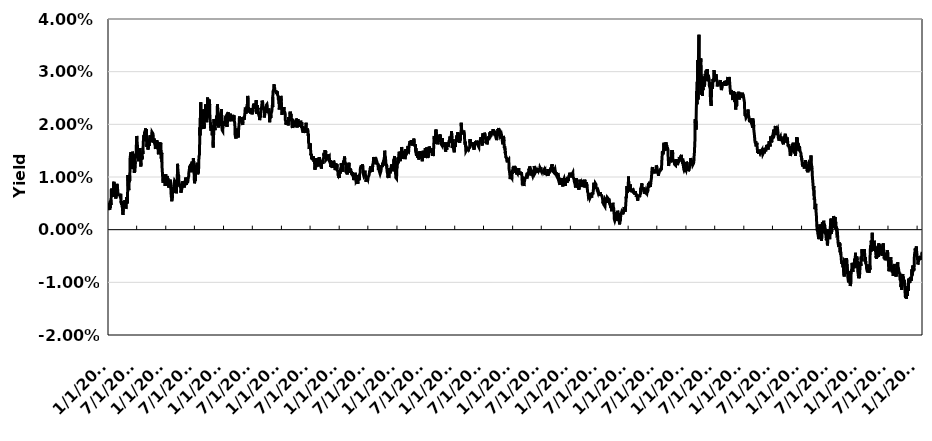
| Category | Spread |
|---|---|
| 1/4/10 | 0.004 |
| 1/5/10 | 0.005 |
| 1/6/10 | 0.004 |
| 1/7/10 | 0.004 |
| 1/8/10 | 0.005 |
| 1/11/10 | 0.004 |
| 1/12/10 | 0.005 |
| 1/13/10 | 0.004 |
| 1/14/10 | 0.005 |
| 1/15/10 | 0.005 |
| 1/19/10 | 0.005 |
| 1/20/10 | 0.006 |
| 1/21/10 | 0.007 |
| 1/22/10 | 0.008 |
| 1/25/10 | 0.007 |
| 1/26/10 | 0.007 |
| 1/27/10 | 0.007 |
| 1/28/10 | 0.008 |
| 1/29/10 | 0.008 |
| 2/1/10 | 0.007 |
| 2/2/10 | 0.006 |
| 2/3/10 | 0.006 |
| 2/4/10 | 0.008 |
| 2/5/10 | 0.009 |
| 2/8/10 | 0.009 |
| 2/9/10 | 0.008 |
| 2/10/10 | 0.008 |
| 2/11/10 | 0.008 |
| 2/12/10 | 0.008 |
| 2/16/10 | 0.008 |
| 2/17/10 | 0.007 |
| 2/18/10 | 0.006 |
| 2/19/10 | 0.006 |
| 2/22/10 | 0.006 |
| 2/23/10 | 0.007 |
| 2/24/10 | 0.007 |
| 2/25/10 | 0.008 |
| 2/26/10 | 0.009 |
| 3/1/10 | 0.008 |
| 3/2/10 | 0.008 |
| 3/3/10 | 0.008 |
| 3/4/10 | 0.008 |
| 3/5/10 | 0.007 |
| 3/8/10 | 0.006 |
| 3/9/10 | 0.007 |
| 3/10/10 | 0.006 |
| 3/11/10 | 0.006 |
| 3/12/10 | 0.007 |
| 3/15/10 | 0.006 |
| 3/16/10 | 0.006 |
| 3/17/10 | 0.006 |
| 3/18/10 | 0.006 |
| 3/19/10 | 0.006 |
| 3/22/10 | 0.007 |
| 3/23/10 | 0.006 |
| 3/24/10 | 0.005 |
| 3/25/10 | 0.005 |
| 3/26/10 | 0.005 |
| 3/29/10 | 0.005 |
| 3/30/10 | 0.005 |
| 3/31/10 | 0.005 |
| 4/1/10 | 0.004 |
| 4/5/10 | 0.003 |
| 4/6/10 | 0.003 |
| 4/7/10 | 0.004 |
| 4/8/10 | 0.004 |
| 4/9/10 | 0.004 |
| 4/12/10 | 0.004 |
| 4/13/10 | 0.005 |
| 4/14/10 | 0.004 |
| 4/15/10 | 0.004 |
| 4/16/10 | 0.006 |
| 4/19/10 | 0.005 |
| 4/20/10 | 0.005 |
| 4/21/10 | 0.005 |
| 4/22/10 | 0.005 |
| 4/23/10 | 0.004 |
| 4/26/10 | 0.004 |
| 4/27/10 | 0.006 |
| 4/28/10 | 0.005 |
| 4/29/10 | 0.005 |
| 4/30/10 | 0.006 |
| 5/3/10 | 0.005 |
| 5/4/10 | 0.007 |
| 5/5/10 | 0.008 |
| 5/6/10 | 0.01 |
| 5/7/10 | 0.01 |
| 5/10/10 | 0.008 |
| 5/11/10 | 0.008 |
| 5/12/10 | 0.008 |
| 5/13/10 | 0.008 |
| 5/14/10 | 0.009 |
| 5/17/10 | 0.009 |
| 5/18/10 | 0.01 |
| 5/19/10 | 0.011 |
| 5/20/10 | 0.013 |
| 5/21/10 | 0.014 |
| 5/24/10 | 0.014 |
| 5/25/10 | 0.015 |
| 5/26/10 | 0.015 |
| 5/27/10 | 0.012 |
| 5/28/10 | 0.013 |
| 6/1/10 | 0.014 |
| 6/2/10 | 0.012 |
| 6/3/10 | 0.012 |
| 6/4/10 | 0.015 |
| 6/7/10 | 0.015 |
| 6/8/10 | 0.014 |
| 6/9/10 | 0.014 |
| 6/10/10 | 0.012 |
| 6/11/10 | 0.013 |
| 6/14/10 | 0.012 |
| 6/15/10 | 0.011 |
| 6/16/10 | 0.011 |
| 6/17/10 | 0.011 |
| 6/18/10 | 0.011 |
| 6/21/10 | 0.011 |
| 6/22/10 | 0.013 |
| 6/23/10 | 0.014 |
| 6/24/10 | 0.014 |
| 6/25/10 | 0.014 |
| 6/28/10 | 0.015 |
| 6/29/10 | 0.016 |
| 6/30/10 | 0.017 |
| 7/1/10 | 0.018 |
| 7/2/10 | 0.017 |
| 7/6/10 | 0.017 |
| 7/7/10 | 0.015 |
| 7/8/10 | 0.015 |
| 7/9/10 | 0.014 |
| 7/12/10 | 0.014 |
| 7/13/10 | 0.013 |
| 7/14/10 | 0.014 |
| 7/15/10 | 0.014 |
| 7/16/10 | 0.015 |
| 7/19/10 | 0.014 |
| 7/20/10 | 0.014 |
| 7/21/10 | 0.016 |
| 7/22/10 | 0.014 |
| 7/23/10 | 0.014 |
| 7/26/10 | 0.013 |
| 7/27/10 | 0.012 |
| 7/28/10 | 0.013 |
| 7/29/10 | 0.014 |
| 7/30/10 | 0.015 |
| 8/2/10 | 0.013 |
| 8/3/10 | 0.014 |
| 8/4/10 | 0.013 |
| 8/5/10 | 0.014 |
| 8/6/10 | 0.015 |
| 8/9/10 | 0.014 |
| 8/10/10 | 0.015 |
| 8/11/10 | 0.017 |
| 8/12/10 | 0.017 |
| 8/13/10 | 0.017 |
| 8/16/10 | 0.018 |
| 8/17/10 | 0.017 |
| 8/18/10 | 0.017 |
| 8/19/10 | 0.018 |
| 8/20/10 | 0.018 |
| 8/23/10 | 0.018 |
| 8/24/10 | 0.019 |
| 8/25/10 | 0.019 |
| 8/26/10 | 0.019 |
| 8/27/10 | 0.017 |
| 8/30/10 | 0.019 |
| 8/31/10 | 0.019 |
| 9/1/10 | 0.017 |
| 9/2/10 | 0.017 |
| 9/3/10 | 0.016 |
| 9/7/10 | 0.017 |
| 9/8/10 | 0.017 |
| 9/9/10 | 0.015 |
| 9/10/10 | 0.015 |
| 9/13/10 | 0.016 |
| 9/14/10 | 0.016 |
| 9/15/10 | 0.016 |
| 9/16/10 | 0.016 |
| 9/17/10 | 0.016 |
| 9/20/10 | 0.016 |
| 9/21/10 | 0.017 |
| 9/22/10 | 0.017 |
| 9/23/10 | 0.018 |
| 9/24/10 | 0.017 |
| 9/27/10 | 0.017 |
| 9/28/10 | 0.018 |
| 9/29/10 | 0.018 |
| 9/30/10 | 0.018 |
| 10/1/10 | 0.017 |
| 10/4/10 | 0.018 |
| 10/5/10 | 0.017 |
| 10/6/10 | 0.018 |
| 10/7/10 | 0.018 |
| 10/8/10 | 0.018 |
| 10/12/10 | 0.018 |
| 10/13/10 | 0.018 |
| 10/14/10 | 0.017 |
| 10/15/10 | 0.016 |
| 10/18/10 | 0.017 |
| 10/19/10 | 0.017 |
| 10/20/10 | 0.017 |
| 10/21/10 | 0.016 |
| 10/22/10 | 0.016 |
| 10/25/10 | 0.017 |
| 10/26/10 | 0.016 |
| 10/27/10 | 0.015 |
| 10/28/10 | 0.016 |
| 10/29/10 | 0.016 |
| 11/1/10 | 0.016 |
| 11/2/10 | 0.016 |
| 11/3/10 | 0.016 |
| 11/4/10 | 0.017 |
| 11/5/10 | 0.017 |
| 11/8/10 | 0.017 |
| 11/9/10 | 0.016 |
| 11/10/10 | 0.017 |
| 11/11/10 | 0.017 |
| 11/12/10 | 0.016 |
| 11/15/10 | 0.014 |
| 11/16/10 | 0.016 |
| 11/17/10 | 0.015 |
| 11/18/10 | 0.015 |
| 11/19/10 | 0.015 |
| 11/22/10 | 0.016 |
| 11/23/10 | 0.017 |
| 11/24/10 | 0.015 |
| 11/26/10 | 0.016 |
| 11/29/10 | 0.016 |
| 11/30/10 | 0.016 |
| 12/1/10 | 0.014 |
| 12/2/10 | 0.014 |
| 12/3/10 | 0.014 |
| 12/6/10 | 0.015 |
| 12/7/10 | 0.013 |
| 12/8/10 | 0.012 |
| 12/9/10 | 0.012 |
| 12/10/10 | 0.011 |
| 12/13/10 | 0.011 |
| 12/14/10 | 0.009 |
| 12/15/10 | 0.009 |
| 12/16/10 | 0.009 |
| 12/17/10 | 0.01 |
| 12/20/10 | 0.01 |
| 12/21/10 | 0.01 |
| 12/22/10 | 0.01 |
| 12/23/10 | 0.009 |
| 12/27/10 | 0.01 |
| 12/28/10 | 0.008 |
| 12/29/10 | 0.01 |
| 12/30/10 | 0.01 |
| 12/31/10 | 0.01 |
| 1/3/11 | 0.01 |
| 1/4/11 | 0.01 |
| 1/5/11 | 0.008 |
| 1/6/11 | 0.009 |
| 1/7/11 | 0.01 |
| 1/10/11 | 0.01 |
| 1/11/11 | 0.01 |
| 1/12/11 | 0.009 |
| 1/13/11 | 0.01 |
| 1/14/11 | 0.009 |
| 1/18/11 | 0.009 |
| 1/19/11 | 0.009 |
| 1/20/11 | 0.008 |
| 1/21/11 | 0.008 |
| 1/24/11 | 0.008 |
| 1/25/11 | 0.009 |
| 1/26/11 | 0.008 |
| 1/27/11 | 0.008 |
| 1/28/11 | 0.01 |
| 1/31/11 | 0.009 |
| 2/1/11 | 0.008 |
| 2/2/11 | 0.008 |
| 2/3/11 | 0.007 |
| 2/4/11 | 0.006 |
| 2/7/11 | 0.006 |
| 2/8/11 | 0.005 |
| 2/9/11 | 0.006 |
| 2/10/11 | 0.006 |
| 2/11/11 | 0.007 |
| 2/14/11 | 0.007 |
| 2/15/11 | 0.007 |
| 2/16/11 | 0.007 |
| 2/17/11 | 0.008 |
| 2/18/11 | 0.007 |
| 2/22/11 | 0.009 |
| 2/23/11 | 0.009 |
| 2/24/11 | 0.009 |
| 2/25/11 | 0.009 |
| 2/28/11 | 0.009 |
| 3/1/11 | 0.009 |
| 3/2/11 | 0.009 |
| 3/3/11 | 0.007 |
| 3/4/11 | 0.008 |
| 3/7/11 | 0.008 |
| 3/8/11 | 0.007 |
| 3/9/11 | 0.007 |
| 3/10/11 | 0.009 |
| 3/11/11 | 0.008 |
| 3/14/11 | 0.009 |
| 3/15/11 | 0.011 |
| 3/16/11 | 0.012 |
| 3/17/11 | 0.012 |
| 3/18/11 | 0.012 |
| 3/21/11 | 0.01 |
| 3/22/11 | 0.01 |
| 3/23/11 | 0.01 |
| 3/24/11 | 0.01 |
| 3/25/11 | 0.009 |
| 3/28/11 | 0.009 |
| 3/29/11 | 0.008 |
| 3/30/11 | 0.008 |
| 3/31/11 | 0.008 |
| 4/1/11 | 0.008 |
| 4/4/11 | 0.008 |
| 4/5/11 | 0.008 |
| 4/6/11 | 0.007 |
| 4/7/11 | 0.007 |
| 4/8/11 | 0.007 |
| 4/11/11 | 0.008 |
| 4/12/11 | 0.008 |
| 4/13/11 | 0.009 |
| 4/14/11 | 0.008 |
| 4/15/11 | 0.008 |
| 4/18/11 | 0.009 |
| 4/19/11 | 0.009 |
| 4/20/11 | 0.008 |
| 4/21/11 | 0.008 |
| 4/25/11 | 0.009 |
| 4/26/11 | 0.009 |
| 4/27/11 | 0.008 |
| 4/28/11 | 0.008 |
| 4/29/11 | 0.008 |
| 5/2/11 | 0.008 |
| 5/3/11 | 0.008 |
| 5/4/11 | 0.009 |
| 5/5/11 | 0.01 |
| 5/6/11 | 0.01 |
| 5/9/11 | 0.01 |
| 5/10/11 | 0.009 |
| 5/11/11 | 0.009 |
| 5/12/11 | 0.008 |
| 5/13/11 | 0.009 |
| 5/16/11 | 0.009 |
| 5/17/11 | 0.009 |
| 5/18/11 | 0.009 |
| 5/19/11 | 0.009 |
| 5/20/11 | 0.009 |
| 5/23/11 | 0.01 |
| 5/24/11 | 0.01 |
| 5/25/11 | 0.01 |
| 5/26/11 | 0.011 |
| 5/27/11 | 0.011 |
| 5/31/11 | 0.011 |
| 6/1/11 | 0.012 |
| 6/2/11 | 0.011 |
| 6/3/11 | 0.012 |
| 6/6/11 | 0.012 |
| 6/7/11 | 0.012 |
| 6/8/11 | 0.012 |
| 6/9/11 | 0.012 |
| 6/10/11 | 0.012 |
| 6/13/11 | 0.012 |
| 6/14/11 | 0.011 |
| 6/15/11 | 0.013 |
| 6/16/11 | 0.013 |
| 6/17/11 | 0.013 |
| 6/20/11 | 0.012 |
| 6/21/11 | 0.012 |
| 6/22/11 | 0.012 |
| 6/23/11 | 0.013 |
| 6/24/11 | 0.014 |
| 6/27/11 | 0.012 |
| 6/28/11 | 0.011 |
| 6/29/11 | 0.01 |
| 6/30/11 | 0.01 |
| 7/1/11 | 0.009 |
| 7/5/11 | 0.01 |
| 7/6/11 | 0.01 |
| 7/7/11 | 0.009 |
| 7/8/11 | 0.011 |
| 7/11/11 | 0.012 |
| 7/12/11 | 0.012 |
| 7/13/11 | 0.012 |
| 7/14/11 | 0.012 |
| 7/15/11 | 0.012 |
| 7/18/11 | 0.013 |
| 7/19/11 | 0.013 |
| 7/20/11 | 0.012 |
| 7/21/11 | 0.011 |
| 7/22/11 | 0.011 |
| 7/25/11 | 0.011 |
| 7/26/11 | 0.011 |
| 7/27/11 | 0.011 |
| 7/28/11 | 0.012 |
| 7/29/11 | 0.014 |
| 8/1/11 | 0.014 |
| 8/2/11 | 0.016 |
| 8/3/11 | 0.016 |
| 8/4/11 | 0.019 |
| 8/5/11 | 0.018 |
| 8/8/11 | 0.022 |
| 8/9/11 | 0.023 |
| 8/10/11 | 0.024 |
| 8/11/11 | 0.021 |
| 8/12/11 | 0.022 |
| 8/15/11 | 0.02 |
| 8/16/11 | 0.021 |
| 8/17/11 | 0.021 |
| 8/18/11 | 0.022 |
| 8/19/11 | 0.023 |
| 8/22/11 | 0.022 |
| 8/23/11 | 0.021 |
| 8/24/11 | 0.019 |
| 8/25/11 | 0.02 |
| 8/26/11 | 0.021 |
| 8/29/11 | 0.019 |
| 8/30/11 | 0.02 |
| 8/31/11 | 0.019 |
| 9/1/11 | 0.02 |
| 9/2/11 | 0.022 |
| 9/6/11 | 0.023 |
| 9/7/11 | 0.022 |
| 9/8/11 | 0.022 |
| 9/9/11 | 0.024 |
| 9/12/11 | 0.023 |
| 9/13/11 | 0.023 |
| 9/14/11 | 0.022 |
| 9/15/11 | 0.021 |
| 9/16/11 | 0.02 |
| 9/19/11 | 0.022 |
| 9/20/11 | 0.021 |
| 9/21/11 | 0.023 |
| 9/22/11 | 0.025 |
| 9/23/11 | 0.024 |
| 9/26/11 | 0.022 |
| 9/27/11 | 0.022 |
| 9/28/11 | 0.022 |
| 9/29/11 | 0.021 |
| 9/30/11 | 0.023 |
| 10/3/11 | 0.025 |
| 10/4/11 | 0.025 |
| 10/5/11 | 0.024 |
| 10/6/11 | 0.022 |
| 10/7/11 | 0.021 |
| 10/11/11 | 0.02 |
| 10/12/11 | 0.019 |
| 10/13/11 | 0.02 |
| 10/14/11 | 0.019 |
| 10/17/11 | 0.02 |
| 10/18/11 | 0.019 |
| 10/19/11 | 0.019 |
| 10/20/11 | 0.019 |
| 10/21/11 | 0.018 |
| 10/24/11 | 0.018 |
| 10/25/11 | 0.019 |
| 10/26/11 | 0.018 |
| 10/27/11 | 0.016 |
| 10/28/11 | 0.017 |
| 10/31/11 | 0.019 |
| 11/1/11 | 0.021 |
| 11/2/11 | 0.02 |
| 11/3/11 | 0.019 |
| 11/4/11 | 0.02 |
| 11/7/11 | 0.02 |
| 11/8/11 | 0.019 |
| 11/9/11 | 0.021 |
| 11/10/11 | 0.02 |
| 11/14/11 | 0.02 |
| 11/15/11 | 0.02 |
| 11/16/11 | 0.021 |
| 11/17/11 | 0.022 |
| 11/18/11 | 0.021 |
| 11/21/11 | 0.022 |
| 11/22/11 | 0.023 |
| 11/23/11 | 0.024 |
| 11/25/11 | 0.023 |
| 11/28/11 | 0.022 |
| 11/29/11 | 0.021 |
| 11/30/11 | 0.02 |
| 12/1/11 | 0.019 |
| 12/2/11 | 0.02 |
| 12/5/11 | 0.02 |
| 12/6/11 | 0.02 |
| 12/7/11 | 0.02 |
| 12/8/11 | 0.021 |
| 12/9/11 | 0.02 |
| 12/12/11 | 0.021 |
| 12/13/11 | 0.021 |
| 12/14/11 | 0.022 |
| 12/15/11 | 0.021 |
| 12/16/11 | 0.022 |
| 12/19/11 | 0.023 |
| 12/20/11 | 0.021 |
| 12/21/11 | 0.02 |
| 12/22/11 | 0.02 |
| 12/23/11 | 0.019 |
| 12/27/11 | 0.019 |
| 12/28/11 | 0.02 |
| 12/29/11 | 0.02 |
| 12/30/11 | 0.02 |
| 1/3/12 | 0.02 |
| 1/4/12 | 0.02 |
| 1/5/12 | 0.02 |
| 1/6/12 | 0.02 |
| 1/9/12 | 0.02 |
| 1/10/12 | 0.02 |
| 1/11/12 | 0.021 |
| 1/12/12 | 0.021 |
| 1/13/12 | 0.021 |
| 1/17/12 | 0.022 |
| 1/18/12 | 0.021 |
| 1/19/12 | 0.021 |
| 1/20/12 | 0.02 |
| 1/23/12 | 0.02 |
| 1/24/12 | 0.02 |
| 1/25/12 | 0.02 |
| 1/26/12 | 0.02 |
| 1/27/12 | 0.021 |
| 1/30/12 | 0.022 |
| 1/31/12 | 0.022 |
| 2/1/12 | 0.022 |
| 2/2/12 | 0.022 |
| 2/3/12 | 0.021 |
| 2/6/12 | 0.022 |
| 2/7/12 | 0.021 |
| 2/8/12 | 0.021 |
| 2/9/12 | 0.021 |
| 2/10/12 | 0.022 |
| 2/13/12 | 0.021 |
| 2/14/12 | 0.022 |
| 2/15/12 | 0.022 |
| 2/16/12 | 0.021 |
| 2/17/12 | 0.021 |
| 2/21/12 | 0.021 |
| 2/22/12 | 0.021 |
| 2/23/12 | 0.021 |
| 2/24/12 | 0.021 |
| 2/27/12 | 0.022 |
| 2/28/12 | 0.022 |
| 2/29/12 | 0.022 |
| 3/1/12 | 0.021 |
| 3/2/12 | 0.021 |
| 3/5/12 | 0.021 |
| 3/6/12 | 0.022 |
| 3/7/12 | 0.022 |
| 3/8/12 | 0.021 |
| 3/9/12 | 0.021 |
| 3/12/12 | 0.02 |
| 3/13/12 | 0.019 |
| 3/14/12 | 0.018 |
| 3/15/12 | 0.018 |
| 3/16/12 | 0.018 |
| 3/19/12 | 0.017 |
| 3/20/12 | 0.017 |
| 3/21/12 | 0.018 |
| 3/22/12 | 0.018 |
| 3/23/12 | 0.019 |
| 3/26/12 | 0.018 |
| 3/27/12 | 0.019 |
| 3/28/12 | 0.019 |
| 3/29/12 | 0.019 |
| 3/30/12 | 0.018 |
| 4/2/12 | 0.018 |
| 4/3/12 | 0.018 |
| 4/4/12 | 0.018 |
| 4/5/12 | 0.019 |
| 4/9/12 | 0.021 |
| 4/10/12 | 0.022 |
| 4/11/12 | 0.021 |
| 4/12/12 | 0.02 |
| 4/13/12 | 0.021 |
| 4/16/12 | 0.021 |
| 4/17/12 | 0.021 |
| 4/18/12 | 0.021 |
| 4/19/12 | 0.021 |
| 4/20/12 | 0.021 |
| 4/23/12 | 0.021 |
| 4/24/12 | 0.021 |
| 4/25/12 | 0.02 |
| 4/26/12 | 0.02 |
| 4/27/12 | 0.02 |
| 4/30/12 | 0.02 |
| 5/1/12 | 0.02 |
| 5/2/12 | 0.02 |
| 5/3/12 | 0.021 |
| 5/4/12 | 0.021 |
| 5/7/12 | 0.021 |
| 5/8/12 | 0.021 |
| 5/9/12 | 0.021 |
| 5/10/12 | 0.021 |
| 5/11/12 | 0.021 |
| 5/14/12 | 0.022 |
| 5/15/12 | 0.022 |
| 5/16/12 | 0.022 |
| 5/17/12 | 0.023 |
| 5/18/12 | 0.023 |
| 5/21/12 | 0.023 |
| 5/22/12 | 0.022 |
| 5/23/12 | 0.023 |
| 5/24/12 | 0.022 |
| 5/25/12 | 0.022 |
| 5/29/12 | 0.022 |
| 5/30/12 | 0.024 |
| 5/31/12 | 0.024 |
| 6/1/12 | 0.025 |
| 6/4/12 | 0.025 |
| 6/5/12 | 0.024 |
| 6/6/12 | 0.023 |
| 6/7/12 | 0.023 |
| 6/8/12 | 0.022 |
| 6/11/12 | 0.023 |
| 6/12/12 | 0.022 |
| 6/13/12 | 0.023 |
| 6/14/12 | 0.022 |
| 6/15/12 | 0.022 |
| 6/18/12 | 0.022 |
| 6/19/12 | 0.022 |
| 6/20/12 | 0.022 |
| 6/21/12 | 0.023 |
| 6/22/12 | 0.022 |
| 6/25/12 | 0.023 |
| 6/26/12 | 0.023 |
| 6/27/12 | 0.022 |
| 6/28/12 | 0.023 |
| 6/29/12 | 0.022 |
| 7/2/12 | 0.023 |
| 7/3/12 | 0.022 |
| 7/5/12 | 0.023 |
| 7/6/12 | 0.023 |
| 7/9/12 | 0.024 |
| 7/10/12 | 0.024 |
| 7/11/12 | 0.024 |
| 7/12/12 | 0.024 |
| 7/13/12 | 0.023 |
| 7/16/12 | 0.024 |
| 7/17/12 | 0.023 |
| 7/18/12 | 0.023 |
| 7/19/12 | 0.023 |
| 7/20/12 | 0.023 |
| 7/23/12 | 0.024 |
| 7/24/12 | 0.024 |
| 7/25/12 | 0.025 |
| 7/26/12 | 0.024 |
| 7/27/12 | 0.022 |
| 7/30/12 | 0.022 |
| 7/31/12 | 0.023 |
| 8/1/12 | 0.023 |
| 8/2/12 | 0.024 |
| 8/3/12 | 0.022 |
| 8/6/12 | 0.022 |
| 8/7/12 | 0.022 |
| 8/8/12 | 0.022 |
| 8/9/12 | 0.022 |
| 8/10/12 | 0.022 |
| 8/13/12 | 0.022 |
| 8/14/12 | 0.022 |
| 8/15/12 | 0.021 |
| 8/16/12 | 0.021 |
| 8/17/12 | 0.021 |
| 8/20/12 | 0.021 |
| 8/21/12 | 0.021 |
| 8/22/12 | 0.022 |
| 8/23/12 | 0.023 |
| 8/24/12 | 0.023 |
| 8/27/12 | 0.023 |
| 8/28/12 | 0.023 |
| 8/29/12 | 0.023 |
| 8/30/12 | 0.024 |
| 8/31/12 | 0.024 |
| 9/4/12 | 0.024 |
| 9/5/12 | 0.024 |
| 9/6/12 | 0.023 |
| 9/7/12 | 0.023 |
| 9/10/12 | 0.023 |
| 9/11/12 | 0.023 |
| 9/12/12 | 0.023 |
| 9/13/12 | 0.022 |
| 9/14/12 | 0.021 |
| 9/17/12 | 0.022 |
| 9/18/12 | 0.022 |
| 9/19/12 | 0.023 |
| 9/20/12 | 0.022 |
| 9/21/12 | 0.023 |
| 9/24/12 | 0.023 |
| 9/25/12 | 0.023 |
| 9/26/12 | 0.024 |
| 9/27/12 | 0.024 |
| 9/28/12 | 0.024 |
| 10/1/12 | 0.024 |
| 10/2/12 | 0.024 |
| 10/3/12 | 0.023 |
| 10/4/12 | 0.023 |
| 10/5/12 | 0.022 |
| 10/9/12 | 0.022 |
| 10/10/12 | 0.022 |
| 10/11/12 | 0.023 |
| 10/12/12 | 0.023 |
| 10/15/12 | 0.023 |
| 10/16/12 | 0.022 |
| 10/17/12 | 0.021 |
| 10/18/12 | 0.02 |
| 10/19/12 | 0.021 |
| 10/22/12 | 0.021 |
| 10/23/12 | 0.022 |
| 10/24/12 | 0.022 |
| 10/25/12 | 0.021 |
| 10/26/12 | 0.022 |
| 10/31/12 | 0.022 |
| 11/1/12 | 0.023 |
| 11/2/12 | 0.023 |
| 11/5/12 | 0.024 |
| 11/6/12 | 0.023 |
| 11/7/12 | 0.025 |
| 11/8/12 | 0.026 |
| 11/9/12 | 0.026 |
| 11/13/12 | 0.027 |
| 11/14/12 | 0.027 |
| 11/15/12 | 0.028 |
| 11/16/12 | 0.027 |
| 11/19/12 | 0.027 |
| 11/20/12 | 0.026 |
| 11/21/12 | 0.026 |
| 11/23/12 | 0.026 |
| 11/26/12 | 0.026 |
| 11/27/12 | 0.026 |
| 11/28/12 | 0.026 |
| 11/29/12 | 0.026 |
| 11/30/12 | 0.026 |
| 12/3/12 | 0.026 |
| 12/4/12 | 0.026 |
| 12/5/12 | 0.026 |
| 12/6/12 | 0.026 |
| 12/7/12 | 0.026 |
| 12/10/12 | 0.026 |
| 12/11/12 | 0.025 |
| 12/12/12 | 0.025 |
| 12/13/12 | 0.025 |
| 12/14/12 | 0.025 |
| 12/17/12 | 0.024 |
| 12/18/12 | 0.023 |
| 12/19/12 | 0.023 |
| 12/20/12 | 0.023 |
| 12/21/12 | 0.024 |
| 12/24/12 | 0.024 |
| 12/26/12 | 0.024 |
| 12/27/12 | 0.025 |
| 12/28/12 | 0.025 |
| 12/31/12 | 0.024 |
| 1/2/13 | 0.023 |
| 1/3/13 | 0.022 |
| 1/4/13 | 0.022 |
| 1/7/13 | 0.022 |
| 1/8/13 | 0.023 |
| 1/9/13 | 0.023 |
| 1/10/13 | 0.022 |
| 1/11/13 | 0.023 |
| 1/14/13 | 0.023 |
| 1/15/13 | 0.023 |
| 1/16/13 | 0.023 |
| 1/17/13 | 0.023 |
| 1/18/13 | 0.022 |
| 1/22/13 | 0.022 |
| 1/23/13 | 0.022 |
| 1/24/13 | 0.022 |
| 1/25/13 | 0.021 |
| 1/28/13 | 0.021 |
| 1/29/13 | 0.02 |
| 1/30/13 | 0.02 |
| 1/31/13 | 0.02 |
| 2/1/13 | 0.02 |
| 2/4/13 | 0.021 |
| 2/5/13 | 0.02 |
| 2/6/13 | 0.02 |
| 2/7/13 | 0.02 |
| 2/8/13 | 0.02 |
| 2/11/13 | 0.02 |
| 2/12/13 | 0.02 |
| 2/13/13 | 0.02 |
| 2/14/13 | 0.021 |
| 2/15/13 | 0.021 |
| 2/19/13 | 0.021 |
| 2/20/13 | 0.021 |
| 2/21/13 | 0.021 |
| 2/22/13 | 0.021 |
| 2/25/13 | 0.022 |
| 2/26/13 | 0.022 |
| 2/27/13 | 0.022 |
| 2/28/13 | 0.022 |
| 3/1/13 | 0.022 |
| 3/4/13 | 0.021 |
| 3/5/13 | 0.021 |
| 3/6/13 | 0.021 |
| 3/7/13 | 0.02 |
| 3/8/13 | 0.02 |
| 3/11/13 | 0.019 |
| 3/12/13 | 0.02 |
| 3/13/13 | 0.02 |
| 3/14/13 | 0.02 |
| 3/15/13 | 0.02 |
| 3/18/13 | 0.02 |
| 3/19/13 | 0.021 |
| 3/20/13 | 0.02 |
| 3/21/13 | 0.02 |
| 3/22/13 | 0.02 |
| 3/25/13 | 0.021 |
| 3/26/13 | 0.02 |
| 3/27/13 | 0.021 |
| 3/28/13 | 0.02 |
| 4/1/13 | 0.02 |
| 4/2/13 | 0.02 |
| 4/3/13 | 0.02 |
| 4/4/13 | 0.021 |
| 4/5/13 | 0.021 |
| 4/8/13 | 0.02 |
| 4/9/13 | 0.02 |
| 4/10/13 | 0.019 |
| 4/11/13 | 0.019 |
| 4/12/13 | 0.02 |
| 4/15/13 | 0.021 |
| 4/16/13 | 0.02 |
| 4/17/13 | 0.021 |
| 4/18/13 | 0.021 |
| 4/19/13 | 0.02 |
| 4/22/13 | 0.02 |
| 4/23/13 | 0.02 |
| 4/24/13 | 0.02 |
| 4/25/13 | 0.02 |
| 4/26/13 | 0.02 |
| 4/29/13 | 0.02 |
| 4/30/13 | 0.02 |
| 5/1/13 | 0.02 |
| 5/2/13 | 0.021 |
| 5/3/13 | 0.02 |
| 5/6/13 | 0.02 |
| 5/7/13 | 0.019 |
| 5/8/13 | 0.02 |
| 5/9/13 | 0.02 |
| 5/10/13 | 0.019 |
| 5/13/13 | 0.019 |
| 5/14/13 | 0.019 |
| 5/15/13 | 0.019 |
| 5/16/13 | 0.02 |
| 5/17/13 | 0.018 |
| 5/20/13 | 0.018 |
| 5/21/13 | 0.019 |
| 5/22/13 | 0.018 |
| 5/23/13 | 0.019 |
| 5/24/13 | 0.019 |
| 5/28/13 | 0.018 |
| 5/29/13 | 0.019 |
| 5/30/13 | 0.019 |
| 5/31/13 | 0.019 |
| 6/3/13 | 0.019 |
| 6/4/13 | 0.019 |
| 6/5/13 | 0.02 |
| 6/6/13 | 0.02 |
| 6/7/13 | 0.019 |
| 6/10/13 | 0.018 |
| 6/11/13 | 0.019 |
| 6/12/13 | 0.019 |
| 6/13/13 | 0.019 |
| 6/14/13 | 0.019 |
| 6/17/13 | 0.019 |
| 6/18/13 | 0.018 |
| 6/19/13 | 0.018 |
| 6/20/13 | 0.018 |
| 6/21/13 | 0.017 |
| 6/24/13 | 0.016 |
| 6/25/13 | 0.015 |
| 6/26/13 | 0.015 |
| 6/27/13 | 0.016 |
| 6/28/13 | 0.015 |
| 7/1/13 | 0.016 |
| 7/2/13 | 0.016 |
| 7/3/13 | 0.016 |
| 7/5/13 | 0.014 |
| 7/8/13 | 0.014 |
| 7/9/13 | 0.014 |
| 7/10/13 | 0.013 |
| 7/11/13 | 0.014 |
| 7/12/13 | 0.013 |
| 7/15/13 | 0.013 |
| 7/16/13 | 0.014 |
| 7/17/13 | 0.014 |
| 7/18/13 | 0.013 |
| 7/19/13 | 0.014 |
| 7/22/13 | 0.014 |
| 7/23/13 | 0.014 |
| 7/24/13 | 0.013 |
| 7/25/13 | 0.013 |
| 7/26/13 | 0.013 |
| 7/29/13 | 0.013 |
| 7/30/13 | 0.012 |
| 7/31/13 | 0.013 |
| 8/1/13 | 0.011 |
| 8/2/13 | 0.013 |
| 8/5/13 | 0.012 |
| 8/6/13 | 0.013 |
| 8/7/13 | 0.013 |
| 8/8/13 | 0.013 |
| 8/9/13 | 0.014 |
| 8/12/13 | 0.013 |
| 8/13/13 | 0.012 |
| 8/14/13 | 0.013 |
| 8/15/13 | 0.013 |
| 8/16/13 | 0.012 |
| 8/19/13 | 0.012 |
| 8/20/13 | 0.013 |
| 8/21/13 | 0.013 |
| 8/22/13 | 0.012 |
| 8/23/13 | 0.012 |
| 8/26/13 | 0.013 |
| 8/27/13 | 0.014 |
| 8/28/13 | 0.013 |
| 8/29/13 | 0.014 |
| 8/30/13 | 0.013 |
| 9/3/13 | 0.013 |
| 9/4/13 | 0.013 |
| 9/5/13 | 0.012 |
| 9/6/13 | 0.012 |
| 9/9/13 | 0.013 |
| 9/10/13 | 0.012 |
| 9/11/13 | 0.012 |
| 9/12/13 | 0.013 |
| 9/13/13 | 0.013 |
| 9/16/13 | 0.013 |
| 9/17/13 | 0.013 |
| 9/18/13 | 0.013 |
| 9/19/13 | 0.012 |
| 9/20/13 | 0.013 |
| 9/23/13 | 0.013 |
| 9/24/13 | 0.014 |
| 9/25/13 | 0.014 |
| 9/26/13 | 0.014 |
| 9/27/13 | 0.015 |
| 9/30/13 | 0.015 |
| 10/1/13 | 0.014 |
| 10/2/13 | 0.015 |
| 10/3/13 | 0.015 |
| 10/4/13 | 0.015 |
| 10/7/13 | 0.015 |
| 10/8/13 | 0.015 |
| 10/9/13 | 0.014 |
| 10/10/13 | 0.013 |
| 10/11/13 | 0.013 |
| 10/15/13 | 0.013 |
| 10/16/13 | 0.014 |
| 10/17/13 | 0.014 |
| 10/18/13 | 0.014 |
| 10/21/13 | 0.014 |
| 10/22/13 | 0.014 |
| 10/23/13 | 0.014 |
| 10/24/13 | 0.014 |
| 10/25/13 | 0.014 |
| 10/28/13 | 0.014 |
| 10/29/13 | 0.014 |
| 10/30/13 | 0.014 |
| 10/31/13 | 0.014 |
| 11/1/13 | 0.013 |
| 11/4/13 | 0.013 |
| 11/5/13 | 0.013 |
| 11/6/13 | 0.012 |
| 11/7/13 | 0.013 |
| 11/8/13 | 0.012 |
| 11/12/13 | 0.012 |
| 11/13/13 | 0.012 |
| 11/14/13 | 0.012 |
| 11/15/13 | 0.012 |
| 11/18/13 | 0.012 |
| 11/19/13 | 0.012 |
| 11/20/13 | 0.012 |
| 11/21/13 | 0.012 |
| 11/22/13 | 0.012 |
| 11/25/13 | 0.012 |
| 11/26/13 | 0.013 |
| 11/27/13 | 0.013 |
| 11/29/13 | 0.013 |
| 12/2/13 | 0.012 |
| 12/3/13 | 0.012 |
| 12/4/13 | 0.012 |
| 12/5/13 | 0.012 |
| 12/6/13 | 0.011 |
| 12/9/13 | 0.012 |
| 12/10/13 | 0.013 |
| 12/11/13 | 0.013 |
| 12/12/13 | 0.012 |
| 12/13/13 | 0.012 |
| 12/16/13 | 0.012 |
| 12/17/13 | 0.012 |
| 12/18/13 | 0.011 |
| 12/19/13 | 0.011 |
| 12/20/13 | 0.011 |
| 12/23/13 | 0.011 |
| 12/24/13 | 0.01 |
| 12/26/13 | 0.011 |
| 12/27/13 | 0.01 |
| 12/30/13 | 0.01 |
| 12/31/13 | 0.01 |
| 1/2/14 | 0.011 |
| 1/3/14 | 0.011 |
| 1/6/14 | 0.011 |
| 1/7/14 | 0.011 |
| 1/8/14 | 0.011 |
| 1/9/14 | 0.011 |
| 1/10/14 | 0.011 |
| 1/13/14 | 0.012 |
| 1/14/14 | 0.013 |
| 1/15/14 | 0.011 |
| 1/16/14 | 0.012 |
| 1/17/14 | 0.012 |
| 1/21/14 | 0.011 |
| 1/22/14 | 0.011 |
| 1/23/14 | 0.012 |
| 1/24/14 | 0.013 |
| 1/27/14 | 0.012 |
| 1/28/14 | 0.012 |
| 1/29/14 | 0.013 |
| 1/30/14 | 0.012 |
| 1/31/14 | 0.012 |
| 2/3/14 | 0.014 |
| 2/4/14 | 0.014 |
| 2/5/14 | 0.013 |
| 2/6/14 | 0.013 |
| 2/7/14 | 0.013 |
| 2/10/14 | 0.013 |
| 2/11/14 | 0.012 |
| 2/12/14 | 0.011 |
| 2/13/14 | 0.011 |
| 2/14/14 | 0.011 |
| 2/18/14 | 0.011 |
| 2/19/14 | 0.011 |
| 2/20/14 | 0.011 |
| 2/21/14 | 0.011 |
| 2/24/14 | 0.011 |
| 2/25/14 | 0.011 |
| 2/26/14 | 0.012 |
| 2/27/14 | 0.012 |
| 2/28/14 | 0.012 |
| 3/3/14 | 0.013 |
| 3/4/14 | 0.011 |
| 3/5/14 | 0.012 |
| 3/6/14 | 0.012 |
| 3/7/14 | 0.011 |
| 3/10/14 | 0.011 |
| 3/11/14 | 0.011 |
| 3/12/14 | 0.011 |
| 3/13/14 | 0.012 |
| 3/14/14 | 0.012 |
| 3/17/14 | 0.011 |
| 3/18/14 | 0.011 |
| 3/19/14 | 0.011 |
| 3/20/14 | 0.01 |
| 3/21/14 | 0.011 |
| 3/24/14 | 0.011 |
| 3/25/14 | 0.01 |
| 3/26/14 | 0.011 |
| 3/27/14 | 0.011 |
| 3/28/14 | 0.01 |
| 3/31/14 | 0.01 |
| 4/1/14 | 0.01 |
| 4/2/14 | 0.009 |
| 4/3/14 | 0.01 |
| 4/4/14 | 0.01 |
| 4/7/14 | 0.01 |
| 4/8/14 | 0.01 |
| 4/9/14 | 0.01 |
| 4/10/14 | 0.011 |
| 4/11/14 | 0.011 |
| 4/14/14 | 0.01 |
| 4/15/14 | 0.01 |
| 4/16/14 | 0.01 |
| 4/17/14 | 0.009 |
| 4/21/14 | 0.009 |
| 4/22/14 | 0.009 |
| 4/23/14 | 0.009 |
| 4/24/14 | 0.009 |
| 4/25/14 | 0.009 |
| 4/28/14 | 0.009 |
| 4/29/14 | 0.009 |
| 4/30/14 | 0.009 |
| 5/1/14 | 0.009 |
| 5/2/14 | 0.01 |
| 5/5/14 | 0.01 |
| 5/6/14 | 0.01 |
| 5/7/14 | 0.009 |
| 5/8/14 | 0.01 |
| 5/9/14 | 0.01 |
| 5/12/14 | 0.01 |
| 5/13/14 | 0.011 |
| 5/14/14 | 0.011 |
| 5/15/14 | 0.012 |
| 5/16/14 | 0.012 |
| 5/19/14 | 0.012 |
| 5/20/14 | 0.012 |
| 5/21/14 | 0.012 |
| 5/22/14 | 0.012 |
| 5/23/14 | 0.012 |
| 5/27/14 | 0.012 |
| 5/28/14 | 0.012 |
| 5/29/14 | 0.012 |
| 5/30/14 | 0.012 |
| 6/2/14 | 0.011 |
| 6/3/14 | 0.01 |
| 6/4/14 | 0.01 |
| 6/5/14 | 0.01 |
| 6/6/14 | 0.01 |
| 6/9/14 | 0.01 |
| 6/10/14 | 0.01 |
| 6/11/14 | 0.011 |
| 6/12/14 | 0.011 |
| 6/13/14 | 0.011 |
| 6/16/14 | 0.01 |
| 6/17/14 | 0.01 |
| 6/18/14 | 0.01 |
| 6/19/14 | 0.009 |
| 6/20/14 | 0.009 |
| 6/23/14 | 0.009 |
| 6/24/14 | 0.01 |
| 6/25/14 | 0.01 |
| 6/26/14 | 0.01 |
| 6/27/14 | 0.01 |
| 6/30/14 | 0.01 |
| 7/1/14 | 0.01 |
| 7/2/14 | 0.01 |
| 7/3/14 | 0.01 |
| 7/7/14 | 0.01 |
| 7/8/14 | 0.01 |
| 7/9/14 | 0.011 |
| 7/10/14 | 0.011 |
| 7/11/14 | 0.011 |
| 7/14/14 | 0.011 |
| 7/15/14 | 0.011 |
| 7/16/14 | 0.011 |
| 7/17/14 | 0.012 |
| 7/18/14 | 0.011 |
| 7/21/14 | 0.012 |
| 7/22/14 | 0.012 |
| 7/23/14 | 0.012 |
| 7/24/14 | 0.011 |
| 7/25/14 | 0.012 |
| 7/28/14 | 0.011 |
| 7/29/14 | 0.012 |
| 7/30/14 | 0.011 |
| 7/31/14 | 0.012 |
| 8/1/14 | 0.012 |
| 8/4/14 | 0.013 |
| 8/5/14 | 0.013 |
| 8/6/14 | 0.014 |
| 8/7/14 | 0.014 |
| 8/8/14 | 0.013 |
| 8/11/14 | 0.013 |
| 8/12/14 | 0.013 |
| 8/13/14 | 0.013 |
| 8/14/14 | 0.013 |
| 8/15/14 | 0.014 |
| 8/18/14 | 0.013 |
| 8/19/14 | 0.013 |
| 8/20/14 | 0.012 |
| 8/21/14 | 0.012 |
| 8/22/14 | 0.013 |
| 8/25/14 | 0.013 |
| 8/26/14 | 0.013 |
| 8/27/14 | 0.013 |
| 8/28/14 | 0.013 |
| 8/29/14 | 0.013 |
| 9/2/14 | 0.012 |
| 9/3/14 | 0.012 |
| 9/4/14 | 0.012 |
| 9/5/14 | 0.011 |
| 9/8/14 | 0.011 |
| 9/9/14 | 0.012 |
| 9/10/14 | 0.011 |
| 9/11/14 | 0.011 |
| 9/12/14 | 0.011 |
| 9/15/14 | 0.011 |
| 9/16/14 | 0.011 |
| 9/17/14 | 0.01 |
| 9/18/14 | 0.011 |
| 9/19/14 | 0.011 |
| 9/22/14 | 0.011 |
| 9/23/14 | 0.012 |
| 9/24/14 | 0.012 |
| 9/25/14 | 0.012 |
| 9/26/14 | 0.012 |
| 9/29/14 | 0.012 |
| 9/30/14 | 0.012 |
| 10/1/14 | 0.013 |
| 10/2/14 | 0.013 |
| 10/3/14 | 0.012 |
| 10/6/14 | 0.012 |
| 10/7/14 | 0.013 |
| 10/8/14 | 0.012 |
| 10/9/14 | 0.013 |
| 10/10/14 | 0.013 |
| 10/14/14 | 0.014 |
| 10/15/14 | 0.015 |
| 10/16/14 | 0.015 |
| 10/17/14 | 0.014 |
| 10/20/14 | 0.014 |
| 10/21/14 | 0.013 |
| 10/22/14 | 0.013 |
| 10/23/14 | 0.012 |
| 10/24/14 | 0.012 |
| 10/27/14 | 0.012 |
| 10/28/14 | 0.012 |
| 10/29/14 | 0.012 |
| 10/30/14 | 0.011 |
| 10/31/14 | 0.011 |
| 11/3/14 | 0.011 |
| 11/4/14 | 0.011 |
| 11/5/14 | 0.01 |
| 11/6/14 | 0.01 |
| 11/7/14 | 0.011 |
| 11/10/14 | 0.01 |
| 11/12/14 | 0.011 |
| 11/13/14 | 0.011 |
| 11/14/14 | 0.012 |
| 11/17/14 | 0.011 |
| 11/18/14 | 0.011 |
| 11/19/14 | 0.011 |
| 11/20/14 | 0.011 |
| 11/21/14 | 0.011 |
| 11/24/14 | 0.012 |
| 11/25/14 | 0.012 |
| 11/26/14 | 0.012 |
| 11/28/14 | 0.012 |
| 12/1/14 | 0.012 |
| 12/2/14 | 0.011 |
| 12/3/14 | 0.011 |
| 12/4/14 | 0.012 |
| 12/5/14 | 0.011 |
| 12/8/14 | 0.012 |
| 12/9/14 | 0.012 |
| 12/10/14 | 0.013 |
| 12/11/14 | 0.012 |
| 12/12/14 | 0.013 |
| 12/15/14 | 0.014 |
| 12/16/14 | 0.014 |
| 12/17/14 | 0.013 |
| 12/18/14 | 0.011 |
| 12/19/14 | 0.012 |
| 12/22/14 | 0.012 |
| 12/23/14 | 0.011 |
| 12/24/14 | 0.01 |
| 12/26/14 | 0.01 |
| 12/29/14 | 0.01 |
| 12/30/14 | 0.011 |
| 12/31/14 | 0.012 |
| 1/2/15 | 0.012 |
| 1/5/15 | 0.013 |
| 1/6/15 | 0.014 |
| 1/7/15 | 0.013 |
| 1/8/15 | 0.013 |
| 1/9/15 | 0.013 |
| 1/12/15 | 0.014 |
| 1/13/15 | 0.014 |
| 1/14/15 | 0.014 |
| 1/15/15 | 0.015 |
| 1/16/15 | 0.014 |
| 1/20/15 | 0.014 |
| 1/21/15 | 0.013 |
| 1/22/15 | 0.013 |
| 1/23/15 | 0.014 |
| 1/26/15 | 0.014 |
| 1/27/15 | 0.014 |
| 1/28/15 | 0.015 |
| 1/29/15 | 0.014 |
| 1/30/15 | 0.016 |
| 2/2/15 | 0.016 |
| 2/3/15 | 0.014 |
| 2/4/15 | 0.015 |
| 2/5/15 | 0.014 |
| 2/6/15 | 0.014 |
| 2/9/15 | 0.015 |
| 2/10/15 | 0.013 |
| 2/11/15 | 0.014 |
| 2/12/15 | 0.015 |
| 2/13/15 | 0.015 |
| 2/17/15 | 0.014 |
| 2/18/15 | 0.014 |
| 2/19/15 | 0.014 |
| 2/20/15 | 0.013 |
| 2/23/15 | 0.014 |
| 2/24/15 | 0.014 |
| 2/25/15 | 0.015 |
| 2/26/15 | 0.015 |
| 2/27/15 | 0.015 |
| 3/2/15 | 0.015 |
| 3/3/15 | 0.014 |
| 3/4/15 | 0.015 |
| 3/5/15 | 0.015 |
| 3/6/15 | 0.014 |
| 3/9/15 | 0.015 |
| 3/10/15 | 0.015 |
| 3/11/15 | 0.016 |
| 3/12/15 | 0.015 |
| 3/13/15 | 0.015 |
| 3/16/15 | 0.015 |
| 3/17/15 | 0.016 |
| 3/18/15 | 0.016 |
| 3/19/15 | 0.016 |
| 3/20/15 | 0.016 |
| 3/23/15 | 0.016 |
| 3/24/15 | 0.017 |
| 3/25/15 | 0.017 |
| 3/26/15 | 0.016 |
| 3/27/15 | 0.017 |
| 3/30/15 | 0.016 |
| 3/31/15 | 0.016 |
| 4/1/15 | 0.017 |
| 4/2/15 | 0.016 |
| 4/6/15 | 0.016 |
| 4/7/15 | 0.017 |
| 4/8/15 | 0.016 |
| 4/9/15 | 0.016 |
| 4/10/15 | 0.016 |
| 4/13/15 | 0.017 |
| 4/14/15 | 0.017 |
| 4/15/15 | 0.017 |
| 4/16/15 | 0.017 |
| 4/17/15 | 0.017 |
| 4/20/15 | 0.016 |
| 4/21/15 | 0.017 |
| 4/22/15 | 0.016 |
| 4/23/15 | 0.016 |
| 4/24/15 | 0.016 |
| 4/27/15 | 0.016 |
| 4/28/15 | 0.015 |
| 4/29/15 | 0.015 |
| 4/30/15 | 0.016 |
| 5/1/15 | 0.015 |
| 5/4/15 | 0.014 |
| 5/5/15 | 0.015 |
| 5/6/15 | 0.014 |
| 5/7/15 | 0.015 |
| 5/8/15 | 0.015 |
| 5/11/15 | 0.014 |
| 5/12/15 | 0.014 |
| 5/13/15 | 0.014 |
| 5/14/15 | 0.014 |
| 5/15/15 | 0.015 |
| 5/18/15 | 0.014 |
| 5/19/15 | 0.013 |
| 5/20/15 | 0.013 |
| 5/21/15 | 0.014 |
| 5/22/15 | 0.014 |
| 5/26/15 | 0.015 |
| 5/27/15 | 0.015 |
| 5/28/15 | 0.015 |
| 5/29/15 | 0.015 |
| 6/1/15 | 0.014 |
| 6/2/15 | 0.014 |
| 6/3/15 | 0.014 |
| 6/4/15 | 0.014 |
| 6/5/15 | 0.014 |
| 6/8/15 | 0.014 |
| 6/9/15 | 0.014 |
| 6/10/15 | 0.013 |
| 6/11/15 | 0.014 |
| 6/12/15 | 0.014 |
| 6/15/15 | 0.015 |
| 6/16/15 | 0.015 |
| 6/17/15 | 0.014 |
| 6/18/15 | 0.014 |
| 6/19/15 | 0.015 |
| 6/22/15 | 0.014 |
| 6/23/15 | 0.014 |
| 6/24/15 | 0.015 |
| 6/25/15 | 0.015 |
| 6/26/15 | 0.014 |
| 6/29/15 | 0.016 |
| 6/30/15 | 0.015 |
| 7/1/15 | 0.014 |
| 7/2/15 | 0.015 |
| 7/6/15 | 0.016 |
| 7/7/15 | 0.015 |
| 7/8/15 | 0.016 |
| 7/9/15 | 0.015 |
| 7/10/15 | 0.014 |
| 7/13/15 | 0.014 |
| 7/14/15 | 0.014 |
| 7/15/15 | 0.014 |
| 7/16/15 | 0.014 |
| 7/17/15 | 0.014 |
| 7/20/15 | 0.014 |
| 7/21/15 | 0.015 |
| 7/22/15 | 0.015 |
| 7/23/15 | 0.016 |
| 7/24/15 | 0.016 |
| 7/27/15 | 0.016 |
| 7/28/15 | 0.015 |
| 7/29/15 | 0.015 |
| 7/30/15 | 0.015 |
| 7/31/15 | 0.015 |
| 8/3/15 | 0.015 |
| 8/4/15 | 0.015 |
| 8/5/15 | 0.015 |
| 8/6/15 | 0.015 |
| 8/7/15 | 0.015 |
| 8/10/15 | 0.015 |
| 8/11/15 | 0.015 |
| 8/12/15 | 0.015 |
| 8/13/15 | 0.014 |
| 8/14/15 | 0.014 |
| 8/17/15 | 0.014 |
| 8/18/15 | 0.014 |
| 8/19/15 | 0.015 |
| 8/20/15 | 0.015 |
| 8/21/15 | 0.016 |
| 8/24/15 | 0.018 |
| 8/25/15 | 0.018 |
| 8/26/15 | 0.017 |
| 8/27/15 | 0.016 |
| 8/28/15 | 0.016 |
| 8/31/15 | 0.017 |
| 9/1/15 | 0.018 |
| 9/2/15 | 0.018 |
| 9/3/15 | 0.018 |
| 9/4/15 | 0.019 |
| 9/8/15 | 0.017 |
| 9/9/15 | 0.018 |
| 9/10/15 | 0.018 |
| 9/11/15 | 0.018 |
| 9/14/15 | 0.018 |
| 9/15/15 | 0.017 |
| 9/16/15 | 0.016 |
| 9/17/15 | 0.017 |
| 9/18/15 | 0.018 |
| 9/21/15 | 0.017 |
| 9/22/15 | 0.018 |
| 9/23/15 | 0.018 |
| 9/24/15 | 0.018 |
| 9/25/15 | 0.017 |
| 9/28/15 | 0.018 |
| 9/29/15 | 0.018 |
| 9/30/15 | 0.017 |
| 10/1/15 | 0.018 |
| 10/2/15 | 0.018 |
| 10/5/15 | 0.017 |
| 10/6/15 | 0.017 |
| 10/7/15 | 0.017 |
| 10/8/15 | 0.016 |
| 10/9/15 | 0.016 |
| 10/12/15 | 0.016 |
| 10/13/15 | 0.017 |
| 10/14/15 | 0.017 |
| 10/15/15 | 0.016 |
| 10/16/15 | 0.016 |
| 10/19/15 | 0.016 |
| 10/20/15 | 0.016 |
| 10/21/15 | 0.016 |
| 10/22/15 | 0.016 |
| 10/23/15 | 0.016 |
| 10/26/15 | 0.016 |
| 10/27/15 | 0.017 |
| 10/28/15 | 0.016 |
| 10/29/15 | 0.016 |
| 10/30/15 | 0.016 |
| 11/2/15 | 0.015 |
| 11/3/15 | 0.015 |
| 11/4/15 | 0.015 |
| 11/5/15 | 0.015 |
| 11/6/15 | 0.016 |
| 11/9/15 | 0.015 |
| 11/10/15 | 0.016 |
| 11/11/15 | 0.015 |
| 11/12/15 | 0.016 |
| 11/13/15 | 0.016 |
| 11/16/15 | 0.016 |
| 11/17/15 | 0.017 |
| 11/18/15 | 0.016 |
| 11/19/15 | 0.016 |
| 11/20/15 | 0.016 |
| 11/23/15 | 0.016 |
| 11/24/15 | 0.016 |
| 11/25/15 | 0.017 |
| 11/27/15 | 0.017 |
| 11/30/15 | 0.017 |
| 12/1/15 | 0.017 |
| 12/2/15 | 0.018 |
| 12/3/15 | 0.016 |
| 12/4/15 | 0.016 |
| 12/7/15 | 0.017 |
| 12/8/15 | 0.017 |
| 12/9/15 | 0.017 |
| 12/10/15 | 0.018 |
| 12/11/15 | 0.019 |
| 12/14/15 | 0.018 |
| 12/15/15 | 0.017 |
| 12/16/15 | 0.016 |
| 12/17/15 | 0.016 |
| 12/18/15 | 0.017 |
| 12/21/15 | 0.017 |
| 12/22/15 | 0.016 |
| 12/23/15 | 0.015 |
| 12/24/15 | 0.016 |
| 12/28/15 | 0.016 |
| 12/29/15 | 0.015 |
| 12/30/15 | 0.015 |
| 12/31/15 | 0.016 |
| 1/4/16 | 0.016 |
| 1/5/16 | 0.016 |
| 1/6/16 | 0.016 |
| 1/7/16 | 0.017 |
| 1/8/16 | 0.017 |
| 1/11/16 | 0.017 |
| 1/12/16 | 0.017 |
| 1/13/16 | 0.018 |
| 1/14/16 | 0.017 |
| 1/15/16 | 0.018 |
| 1/19/16 | 0.017 |
| 1/20/16 | 0.018 |
| 1/21/16 | 0.018 |
| 1/22/16 | 0.017 |
| 1/25/16 | 0.018 |
| 1/26/16 | 0.018 |
| 1/27/16 | 0.018 |
| 1/28/16 | 0.017 |
| 1/29/16 | 0.017 |
| 2/1/16 | 0.017 |
| 2/2/16 | 0.017 |
| 2/3/16 | 0.017 |
| 2/4/16 | 0.017 |
| 2/5/16 | 0.017 |
| 2/8/16 | 0.018 |
| 2/9/16 | 0.018 |
| 2/10/16 | 0.019 |
| 2/11/16 | 0.02 |
| 2/12/16 | 0.019 |
| 2/16/16 | 0.019 |
| 2/17/16 | 0.018 |
| 2/18/16 | 0.019 |
| 2/19/16 | 0.019 |
| 2/22/16 | 0.018 |
| 2/23/16 | 0.018 |
| 2/24/16 | 0.018 |
| 2/25/16 | 0.018 |
| 2/26/16 | 0.019 |
| 2/29/16 | 0.019 |
| 3/1/16 | 0.018 |
| 3/2/16 | 0.018 |
| 3/3/16 | 0.018 |
| 3/4/16 | 0.017 |
| 3/7/16 | 0.016 |
| 3/8/16 | 0.017 |
| 3/9/16 | 0.016 |
| 3/10/16 | 0.016 |
| 3/11/16 | 0.015 |
| 3/14/16 | 0.015 |
| 3/15/16 | 0.015 |
| 3/16/16 | 0.015 |
| 3/17/16 | 0.015 |
| 3/18/16 | 0.015 |
| 3/21/16 | 0.015 |
| 3/22/16 | 0.015 |
| 3/23/16 | 0.015 |
| 3/24/16 | 0.015 |
| 3/28/16 | 0.015 |
| 3/29/16 | 0.016 |
| 3/30/16 | 0.015 |
| 3/31/16 | 0.016 |
| 4/1/16 | 0.016 |
| 4/4/16 | 0.016 |
| 4/5/16 | 0.017 |
| 4/6/16 | 0.017 |
| 4/7/16 | 0.017 |
| 4/8/16 | 0.017 |
| 4/11/16 | 0.017 |
| 4/12/16 | 0.016 |
| 4/13/16 | 0.016 |
| 4/14/16 | 0.016 |
| 4/15/16 | 0.016 |
| 4/18/16 | 0.016 |
| 4/19/16 | 0.016 |
| 4/20/16 | 0.016 |
| 4/21/16 | 0.017 |
| 4/22/16 | 0.016 |
| 4/25/16 | 0.016 |
| 4/26/16 | 0.016 |
| 4/27/16 | 0.016 |
| 4/28/16 | 0.016 |
| 4/29/16 | 0.016 |
| 5/2/16 | 0.015 |
| 5/3/16 | 0.016 |
| 5/4/16 | 0.016 |
| 5/5/16 | 0.016 |
| 5/6/16 | 0.016 |
| 5/9/16 | 0.016 |
| 5/10/16 | 0.016 |
| 5/11/16 | 0.017 |
| 5/12/16 | 0.016 |
| 5/13/16 | 0.017 |
| 5/16/16 | 0.016 |
| 5/17/16 | 0.017 |
| 5/18/16 | 0.016 |
| 5/19/16 | 0.016 |
| 5/20/16 | 0.016 |
| 5/23/16 | 0.017 |
| 5/24/16 | 0.016 |
| 5/25/16 | 0.016 |
| 5/26/16 | 0.016 |
| 5/27/16 | 0.016 |
| 5/31/16 | 0.016 |
| 6/1/16 | 0.016 |
| 6/2/16 | 0.016 |
| 6/3/16 | 0.017 |
| 6/6/16 | 0.016 |
| 6/7/16 | 0.017 |
| 6/8/16 | 0.016 |
| 6/9/16 | 0.017 |
| 6/10/16 | 0.017 |
| 6/13/16 | 0.017 |
| 6/14/16 | 0.017 |
| 6/15/16 | 0.018 |
| 6/16/16 | 0.018 |
| 6/17/16 | 0.017 |
| 6/20/16 | 0.017 |
| 6/21/16 | 0.016 |
| 6/22/16 | 0.017 |
| 6/23/16 | 0.016 |
| 6/24/16 | 0.018 |
| 6/27/16 | 0.018 |
| 6/28/16 | 0.018 |
| 6/29/16 | 0.018 |
| 6/30/16 | 0.017 |
| 7/1/16 | 0.017 |
| 7/5/16 | 0.018 |
| 7/6/16 | 0.018 |
| 7/7/16 | 0.018 |
| 7/8/16 | 0.018 |
| 7/11/16 | 0.018 |
| 7/12/16 | 0.017 |
| 7/13/16 | 0.018 |
| 7/14/16 | 0.017 |
| 7/15/16 | 0.016 |
| 7/18/16 | 0.016 |
| 7/19/16 | 0.017 |
| 7/20/16 | 0.017 |
| 7/21/16 | 0.017 |
| 7/22/16 | 0.016 |
| 7/25/16 | 0.016 |
| 7/26/16 | 0.017 |
| 7/27/16 | 0.017 |
| 7/28/16 | 0.017 |
| 7/29/16 | 0.018 |
| 8/1/16 | 0.017 |
| 8/2/16 | 0.017 |
| 8/3/16 | 0.017 |
| 8/4/16 | 0.018 |
| 8/5/16 | 0.017 |
| 8/8/16 | 0.017 |
| 8/9/16 | 0.018 |
| 8/10/16 | 0.019 |
| 8/11/16 | 0.018 |
| 8/12/16 | 0.018 |
| 8/15/16 | 0.019 |
| 8/16/16 | 0.019 |
| 8/17/16 | 0.018 |
| 8/18/16 | 0.018 |
| 8/19/16 | 0.018 |
| 8/22/16 | 0.018 |
| 8/23/16 | 0.019 |
| 8/24/16 | 0.018 |
| 8/25/16 | 0.018 |
| 8/26/16 | 0.019 |
| 8/29/16 | 0.019 |
| 8/30/16 | 0.019 |
| 8/31/16 | 0.019 |
| 9/1/16 | 0.019 |
| 9/2/16 | 0.019 |
| 9/6/16 | 0.019 |
| 9/7/16 | 0.019 |
| 9/8/16 | 0.018 |
| 9/9/16 | 0.019 |
| 9/12/16 | 0.018 |
| 9/13/16 | 0.018 |
| 9/14/16 | 0.018 |
| 9/15/16 | 0.018 |
| 9/16/16 | 0.018 |
| 9/19/16 | 0.017 |
| 9/20/16 | 0.017 |
| 9/21/16 | 0.017 |
| 9/22/16 | 0.017 |
| 9/23/16 | 0.017 |
| 9/26/16 | 0.018 |
| 9/27/16 | 0.018 |
| 9/28/16 | 0.018 |
| 9/29/16 | 0.019 |
| 9/30/16 | 0.019 |
| 10/3/16 | 0.019 |
| 10/4/16 | 0.019 |
| 10/5/16 | 0.019 |
| 10/6/16 | 0.019 |
| 10/7/16 | 0.019 |
| 10/10/16 | 0.019 |
| 10/11/16 | 0.019 |
| 10/12/16 | 0.018 |
| 10/13/16 | 0.018 |
| 10/14/16 | 0.018 |
| 10/17/16 | 0.018 |
| 10/18/16 | 0.018 |
| 10/19/16 | 0.018 |
| 10/20/16 | 0.018 |
| 10/21/16 | 0.018 |
| 10/24/16 | 0.018 |
| 10/25/16 | 0.018 |
| 10/26/16 | 0.017 |
| 10/27/16 | 0.017 |
| 10/28/16 | 0.017 |
| 10/31/16 | 0.016 |
| 11/1/16 | 0.017 |
| 11/2/16 | 0.018 |
| 11/3/16 | 0.017 |
| 11/4/16 | 0.018 |
| 11/7/16 | 0.017 |
| 11/8/16 | 0.016 |
| 11/9/16 | 0.016 |
| 11/10/16 | 0.016 |
| 11/11/16 | 0.016 |
| 11/14/16 | 0.015 |
| 11/15/16 | 0.014 |
| 11/16/16 | 0.015 |
| 11/17/16 | 0.014 |
| 11/18/16 | 0.014 |
| 11/21/16 | 0.014 |
| 11/22/16 | 0.014 |
| 11/23/16 | 0.014 |
| 11/25/16 | 0.013 |
| 11/28/16 | 0.013 |
| 11/29/16 | 0.013 |
| 11/30/16 | 0.013 |
| 12/1/16 | 0.013 |
| 12/2/16 | 0.013 |
| 12/5/16 | 0.013 |
| 12/6/16 | 0.013 |
| 12/7/16 | 0.013 |
| 12/8/16 | 0.013 |
| 12/9/16 | 0.012 |
| 12/12/16 | 0.011 |
| 12/13/16 | 0.011 |
| 12/14/16 | 0.011 |
| 12/15/16 | 0.01 |
| 12/16/16 | 0.01 |
| 12/19/16 | 0.01 |
| 12/20/16 | 0.01 |
| 12/21/16 | 0.01 |
| 12/22/16 | 0.01 |
| 12/23/16 | 0.01 |
| 12/27/16 | 0.01 |
| 12/28/16 | 0.011 |
| 12/29/16 | 0.011 |
| 12/30/16 | 0.011 |
| 1/3/17 | 0.011 |
| 1/4/17 | 0.011 |
| 1/5/17 | 0.012 |
| 1/6/17 | 0.011 |
| 1/9/17 | 0.012 |
| 1/10/17 | 0.012 |
| 1/11/17 | 0.012 |
| 1/12/17 | 0.012 |
| 1/13/17 | 0.012 |
| 1/17/17 | 0.012 |
| 1/18/17 | 0.011 |
| 1/19/17 | 0.011 |
| 1/20/17 | 0.011 |
| 1/23/17 | 0.012 |
| 1/24/17 | 0.011 |
| 1/25/17 | 0.01 |
| 1/26/17 | 0.011 |
| 1/27/17 | 0.011 |
| 1/30/17 | 0.011 |
| 1/31/17 | 0.011 |
| 2/1/17 | 0.011 |
| 2/2/17 | 0.011 |
| 2/3/17 | 0.01 |
| 2/6/17 | 0.011 |
| 2/7/17 | 0.011 |
| 2/8/17 | 0.012 |
| 2/9/17 | 0.011 |
| 2/10/17 | 0.011 |
| 2/13/17 | 0.011 |
| 2/14/17 | 0.011 |
| 2/15/17 | 0.01 |
| 2/16/17 | 0.011 |
| 2/17/17 | 0.011 |
| 2/21/17 | 0.01 |
| 2/22/17 | 0.011 |
| 2/23/17 | 0.011 |
| 2/24/17 | 0.011 |
| 2/27/17 | 0.01 |
| 2/28/17 | 0.01 |
| 3/1/17 | 0.01 |
| 3/2/17 | 0.009 |
| 3/3/17 | 0.009 |
| 3/6/17 | 0.009 |
| 3/7/17 | 0.009 |
| 3/8/17 | 0.009 |
| 3/9/17 | 0.009 |
| 3/10/17 | 0.009 |
| 3/13/17 | 0.008 |
| 3/14/17 | 0.008 |
| 3/15/17 | 0.009 |
| 3/16/17 | 0.009 |
| 3/17/17 | 0.009 |
| 3/20/17 | 0.01 |
| 3/21/17 | 0.01 |
| 3/22/17 | 0.01 |
| 3/23/17 | 0.01 |
| 3/24/17 | 0.01 |
| 3/27/17 | 0.01 |
| 3/28/17 | 0.01 |
| 3/29/17 | 0.01 |
| 3/30/17 | 0.01 |
| 3/31/17 | 0.01 |
| 4/3/17 | 0.011 |
| 4/4/17 | 0.011 |
| 4/5/17 | 0.011 |
| 4/6/17 | 0.011 |
| 4/7/17 | 0.01 |
| 4/10/17 | 0.01 |
| 4/11/17 | 0.011 |
| 4/12/17 | 0.011 |
| 4/13/17 | 0.012 |
| 4/17/17 | 0.011 |
| 4/18/17 | 0.012 |
| 4/19/17 | 0.012 |
| 4/20/17 | 0.012 |
| 4/21/17 | 0.012 |
| 4/24/17 | 0.011 |
| 4/25/17 | 0.01 |
| 4/26/17 | 0.011 |
| 4/27/17 | 0.011 |
| 4/28/17 | 0.011 |
| 5/1/17 | 0.011 |
| 5/2/17 | 0.011 |
| 5/3/17 | 0.011 |
| 5/4/17 | 0.011 |
| 5/5/17 | 0.01 |
| 5/8/17 | 0.01 |
| 5/9/17 | 0.01 |
| 5/10/17 | 0.01 |
| 5/11/17 | 0.01 |
| 5/12/17 | 0.011 |
| 5/15/17 | 0.011 |
| 5/16/17 | 0.011 |
| 5/17/17 | 0.012 |
| 5/18/17 | 0.012 |
| 5/19/17 | 0.012 |
| 5/22/17 | 0.011 |
| 5/23/17 | 0.011 |
| 5/24/17 | 0.011 |
| 5/25/17 | 0.011 |
| 5/26/17 | 0.011 |
| 5/30/17 | 0.011 |
| 5/31/17 | 0.011 |
| 6/1/17 | 0.011 |
| 6/2/17 | 0.011 |
| 6/5/17 | 0.011 |
| 6/6/17 | 0.012 |
| 6/7/17 | 0.011 |
| 6/8/17 | 0.011 |
| 6/9/17 | 0.011 |
| 6/12/17 | 0.011 |
| 6/13/17 | 0.011 |
| 6/14/17 | 0.012 |
| 6/15/17 | 0.011 |
| 6/16/17 | 0.011 |
| 6/19/17 | 0.011 |
| 6/20/17 | 0.011 |
| 6/21/17 | 0.012 |
| 6/22/17 | 0.012 |
| 6/23/17 | 0.012 |
| 6/26/17 | 0.012 |
| 6/27/17 | 0.012 |
| 6/28/17 | 0.012 |
| 6/29/17 | 0.012 |
| 6/30/17 | 0.011 |
| 7/3/17 | 0.011 |
| 7/5/17 | 0.011 |
| 7/6/17 | 0.011 |
| 7/7/17 | 0.011 |
| 7/10/17 | 0.011 |
| 7/11/17 | 0.011 |
| 7/12/17 | 0.011 |
| 7/13/17 | 0.011 |
| 7/14/17 | 0.011 |
| 7/17/17 | 0.011 |
| 7/18/17 | 0.011 |
| 7/19/17 | 0.011 |
| 7/20/17 | 0.011 |
| 7/21/17 | 0.011 |
| 7/24/17 | 0.011 |
| 7/25/17 | 0.011 |
| 7/26/17 | 0.011 |
| 7/27/17 | 0.01 |
| 7/28/17 | 0.011 |
| 7/31/17 | 0.011 |
| 8/1/17 | 0.011 |
| 8/2/17 | 0.01 |
| 8/3/17 | 0.011 |
| 8/4/17 | 0.01 |
| 8/7/17 | 0.01 |
| 8/8/17 | 0.01 |
| 8/9/17 | 0.011 |
| 8/10/17 | 0.011 |
| 8/11/17 | 0.012 |
| 8/14/17 | 0.011 |
| 8/15/17 | 0.01 |
| 8/16/17 | 0.011 |
| 8/17/17 | 0.011 |
| 8/18/17 | 0.011 |
| 8/21/17 | 0.011 |
| 8/22/17 | 0.011 |
| 8/23/17 | 0.011 |
| 8/24/17 | 0.011 |
| 8/25/17 | 0.011 |
| 8/28/17 | 0.011 |
| 8/29/17 | 0.011 |
| 8/30/17 | 0.012 |
| 8/31/17 | 0.012 |
| 9/1/17 | 0.011 |
| 9/5/17 | 0.012 |
| 9/6/17 | 0.012 |
| 9/7/17 | 0.012 |
| 9/8/17 | 0.012 |
| 9/11/17 | 0.011 |
| 9/12/17 | 0.011 |
| 9/13/17 | 0.011 |
| 9/14/17 | 0.011 |
| 9/15/17 | 0.011 |
| 9/18/17 | 0.011 |
| 9/19/17 | 0.011 |
| 9/20/17 | 0.011 |
| 9/21/17 | 0.011 |
| 9/22/17 | 0.011 |
| 9/25/17 | 0.012 |
| 9/26/17 | 0.011 |
| 9/27/17 | 0.011 |
| 9/28/17 | 0.011 |
| 9/29/17 | 0.011 |
| 10/2/17 | 0.011 |
| 10/3/17 | 0.011 |
| 10/4/17 | 0.011 |
| 10/5/17 | 0.01 |
| 10/6/17 | 0.01 |
| 10/9/17 | 0.01 |
| 10/10/17 | 0.01 |
| 10/11/17 | 0.01 |
| 10/12/17 | 0.01 |
| 10/13/17 | 0.011 |
| 10/16/17 | 0.011 |
| 10/17/17 | 0.01 |
| 10/18/17 | 0.01 |
| 10/19/17 | 0.01 |
| 10/20/17 | 0.009 |
| 10/23/17 | 0.009 |
| 10/24/17 | 0.009 |
| 10/25/17 | 0.009 |
| 10/26/17 | 0.008 |
| 10/27/17 | 0.009 |
| 10/30/17 | 0.009 |
| 10/31/17 | 0.009 |
| 11/1/17 | 0.009 |
| 11/2/17 | 0.01 |
| 11/3/17 | 0.01 |
| 11/6/17 | 0.01 |
| 11/7/17 | 0.009 |
| 11/8/17 | 0.009 |
| 11/9/17 | 0.009 |
| 11/10/17 | 0.009 |
| 11/13/17 | 0.008 |
| 11/14/17 | 0.008 |
| 11/15/17 | 0.009 |
| 11/16/17 | 0.009 |
| 11/17/17 | 0.009 |
| 11/20/17 | 0.009 |
| 11/21/17 | 0.009 |
| 11/22/17 | 0.01 |
| 11/24/17 | 0.009 |
| 11/27/17 | 0.01 |
| 11/28/17 | 0.009 |
| 11/29/17 | 0.009 |
| 11/30/17 | 0.008 |
| 12/1/17 | 0.009 |
| 12/4/17 | 0.009 |
| 12/5/17 | 0.01 |
| 12/6/17 | 0.01 |
| 12/7/17 | 0.009 |
| 12/8/17 | 0.009 |
| 12/11/17 | 0.009 |
| 12/12/17 | 0.009 |
| 12/13/17 | 0.01 |
| 12/14/17 | 0.01 |
| 12/15/17 | 0.01 |
| 12/18/17 | 0.01 |
| 12/19/17 | 0.01 |
| 12/20/17 | 0.01 |
| 12/21/17 | 0.01 |
| 12/22/17 | 0.01 |
| 12/26/17 | 0.01 |
| 12/27/17 | 0.011 |
| 12/28/17 | 0.01 |
| 12/29/17 | 0.011 |
| 1/2/18 | 0.01 |
| 1/3/18 | 0.011 |
| 1/4/18 | 0.011 |
| 1/5/18 | 0.011 |
| 1/8/18 | 0.01 |
| 1/9/18 | 0.01 |
| 1/10/18 | 0.01 |
| 1/11/18 | 0.011 |
| 1/12/18 | 0.011 |
| 1/16/18 | 0.011 |
| 1/17/18 | 0.01 |
| 1/18/18 | 0.01 |
| 1/19/18 | 0.01 |
| 1/22/18 | 0.01 |
| 1/23/18 | 0.01 |
| 1/24/18 | 0.01 |
| 1/25/18 | 0.009 |
| 1/26/18 | 0.009 |
| 1/29/18 | 0.009 |
| 1/30/18 | 0.009 |
| 1/31/18 | 0.008 |
| 2/1/18 | 0.008 |
| 2/2/18 | 0.008 |
| 2/5/18 | 0.009 |
| 2/6/18 | 0.01 |
| 2/7/18 | 0.009 |
| 2/8/18 | 0.01 |
| 2/9/18 | 0.009 |
| 2/12/18 | 0.009 |
| 2/13/18 | 0.009 |
| 2/14/18 | 0.008 |
| 2/15/18 | 0.008 |
| 2/16/18 | 0.008 |
| 2/20/18 | 0.008 |
| 2/21/18 | 0.008 |
| 2/22/18 | 0.008 |
| 2/23/18 | 0.008 |
| 2/26/18 | 0.008 |
| 2/27/18 | 0.008 |
| 2/28/18 | 0.009 |
| 3/1/18 | 0.009 |
| 3/2/18 | 0.009 |
| 3/5/18 | 0.008 |
| 3/6/18 | 0.009 |
| 3/7/18 | 0.009 |
| 3/8/18 | 0.009 |
| 3/9/18 | 0.008 |
| 3/12/18 | 0.009 |
| 3/13/18 | 0.009 |
| 3/14/18 | 0.009 |
| 3/15/18 | 0.009 |
| 3/16/18 | 0.008 |
| 3/19/18 | 0.008 |
| 3/20/18 | 0.008 |
| 3/21/18 | 0.008 |
| 3/22/18 | 0.009 |
| 3/23/18 | 0.009 |
| 3/26/18 | 0.009 |
| 3/27/18 | 0.009 |
| 3/28/18 | 0.009 |
| 3/29/18 | 0.009 |
| 4/2/18 | 0.009 |
| 4/3/18 | 0.009 |
| 4/4/18 | 0.009 |
| 4/5/18 | 0.008 |
| 4/6/18 | 0.009 |
| 4/9/18 | 0.009 |
| 4/10/18 | 0.009 |
| 4/11/18 | 0.009 |
| 4/12/18 | 0.009 |
| 4/13/18 | 0.009 |
| 4/16/18 | 0.008 |
| 4/17/18 | 0.008 |
| 4/18/18 | 0.008 |
| 4/19/18 | 0.007 |
| 4/20/18 | 0.007 |
| 4/23/18 | 0.007 |
| 4/24/18 | 0.006 |
| 4/25/18 | 0.006 |
| 4/26/18 | 0.006 |
| 4/27/18 | 0.006 |
| 4/30/18 | 0.006 |
| 5/1/18 | 0.006 |
| 5/2/18 | 0.006 |
| 5/3/18 | 0.006 |
| 5/4/18 | 0.006 |
| 5/7/18 | 0.006 |
| 5/8/18 | 0.007 |
| 5/9/18 | 0.007 |
| 5/10/18 | 0.007 |
| 5/11/18 | 0.007 |
| 5/14/18 | 0.007 |
| 5/15/18 | 0.006 |
| 5/16/18 | 0.006 |
| 5/17/18 | 0.006 |
| 5/18/18 | 0.007 |
| 5/21/18 | 0.007 |
| 5/22/18 | 0.007 |
| 5/23/18 | 0.007 |
| 5/24/18 | 0.007 |
| 5/25/18 | 0.007 |
| 5/29/18 | 0.009 |
| 5/30/18 | 0.008 |
| 5/31/18 | 0.008 |
| 6/1/18 | 0.008 |
| 6/4/18 | 0.008 |
| 6/5/18 | 0.008 |
| 6/6/18 | 0.008 |
| 6/7/18 | 0.009 |
| 6/8/18 | 0.009 |
| 6/11/18 | 0.009 |
| 6/12/18 | 0.008 |
| 6/13/18 | 0.008 |
| 6/14/18 | 0.008 |
| 6/15/18 | 0.008 |
| 6/18/18 | 0.008 |
| 6/19/18 | 0.008 |
| 6/20/18 | 0.007 |
| 6/21/18 | 0.008 |
| 6/22/18 | 0.007 |
| 6/25/18 | 0.007 |
| 6/26/18 | 0.007 |
| 6/27/18 | 0.007 |
| 6/28/18 | 0.007 |
| 6/29/18 | 0.007 |
| 7/2/18 | 0.007 |
| 7/3/18 | 0.007 |
| 7/5/18 | 0.007 |
| 7/6/18 | 0.007 |
| 7/9/18 | 0.007 |
| 7/10/18 | 0.007 |
| 7/11/18 | 0.007 |
| 7/12/18 | 0.007 |
| 7/13/18 | 0.007 |
| 7/16/18 | 0.007 |
| 7/17/18 | 0.006 |
| 7/18/18 | 0.006 |
| 7/19/18 | 0.007 |
| 7/20/18 | 0.006 |
| 7/23/18 | 0.006 |
| 7/24/18 | 0.006 |
| 7/25/18 | 0.006 |
| 7/26/18 | 0.005 |
| 7/27/18 | 0.005 |
| 7/30/18 | 0.005 |
| 7/31/18 | 0.005 |
| 8/1/18 | 0.005 |
| 8/2/18 | 0.005 |
| 8/3/18 | 0.005 |
| 8/6/18 | 0.005 |
| 8/7/18 | 0.004 |
| 8/8/18 | 0.005 |
| 8/9/18 | 0.005 |
| 8/10/18 | 0.006 |
| 8/13/18 | 0.006 |
| 8/14/18 | 0.005 |
| 8/15/18 | 0.005 |
| 8/16/18 | 0.005 |
| 8/17/18 | 0.005 |
| 8/20/18 | 0.006 |
| 8/21/18 | 0.006 |
| 8/22/18 | 0.006 |
| 8/23/18 | 0.006 |
| 8/24/18 | 0.006 |
| 8/27/18 | 0.006 |
| 8/28/18 | 0.006 |
| 8/29/18 | 0.005 |
| 8/30/18 | 0.006 |
| 8/31/18 | 0.006 |
| 9/4/18 | 0.005 |
| 9/5/18 | 0.005 |
| 9/6/18 | 0.005 |
| 9/7/18 | 0.005 |
| 9/10/18 | 0.005 |
| 9/11/18 | 0.004 |
| 9/12/18 | 0.004 |
| 9/13/18 | 0.004 |
| 9/14/18 | 0.004 |
| 9/17/18 | 0.004 |
| 9/18/18 | 0.004 |
| 9/19/18 | 0.004 |
| 9/20/18 | 0.004 |
| 9/21/18 | 0.004 |
| 9/24/18 | 0.004 |
| 9/25/18 | 0.004 |
| 9/26/18 | 0.005 |
| 9/27/18 | 0.005 |
| 9/28/18 | 0.004 |
| 10/1/18 | 0.004 |
| 10/2/18 | 0.004 |
| 10/3/18 | 0.004 |
| 10/4/18 | 0.003 |
| 10/5/18 | 0.002 |
| 10/8/18 | 0.002 |
| 10/9/18 | 0.002 |
| 10/10/18 | 0.002 |
| 10/11/18 | 0.003 |
| 10/12/18 | 0.003 |
| 10/15/18 | 0.003 |
| 10/16/18 | 0.003 |
| 10/17/18 | 0.002 |
| 10/18/18 | 0.003 |
| 10/19/18 | 0.002 |
| 10/22/18 | 0.002 |
| 10/23/18 | 0.002 |
| 10/24/18 | 0.002 |
| 10/25/18 | 0.002 |
| 10/26/18 | 0.004 |
| 10/29/18 | 0.003 |
| 10/30/18 | 0.003 |
| 10/31/18 | 0.003 |
| 11/1/18 | 0.003 |
| 11/2/18 | 0.003 |
| 11/5/18 | 0.002 |
| 11/6/18 | 0.001 |
| 11/7/18 | 0.001 |
| 11/8/18 | 0.001 |
| 11/9/18 | 0.001 |
| 11/12/18 | 0.001 |
| 11/13/18 | 0.002 |
| 11/14/18 | 0.002 |
| 11/15/18 | 0.003 |
| 11/16/18 | 0.003 |
| 11/19/18 | 0.003 |
| 11/20/18 | 0.003 |
| 11/21/18 | 0.003 |
| 11/23/18 | 0.004 |
| 11/26/18 | 0.003 |
| 11/27/18 | 0.003 |
| 11/28/18 | 0.003 |
| 11/29/18 | 0.003 |
| 11/30/18 | 0.003 |
| 12/3/18 | 0.003 |
| 12/4/18 | 0.004 |
| 12/6/18 | 0.004 |
| 12/7/18 | 0.004 |
| 12/10/18 | 0.004 |
| 12/11/18 | 0.004 |
| 12/12/18 | 0.004 |
| 12/13/18 | 0.003 |
| 12/14/18 | 0.004 |
| 12/17/18 | 0.005 |
| 12/18/18 | 0.006 |
| 12/19/18 | 0.006 |
| 12/20/18 | 0.006 |
| 12/21/18 | 0.006 |
| 12/24/18 | 0.008 |
| 12/26/18 | 0.007 |
| 12/27/18 | 0.007 |
| 12/28/18 | 0.008 |
| 12/31/18 | 0.008 |
| 1/2/19 | 0.009 |
| 1/3/19 | 0.01 |
| 1/4/19 | 0.009 |
| 1/7/19 | 0.008 |
| 1/8/19 | 0.008 |
| 1/9/19 | 0.008 |
| 1/10/19 | 0.007 |
| 1/11/19 | 0.008 |
| 1/14/19 | 0.009 |
| 1/15/19 | 0.008 |
| 1/16/19 | 0.008 |
| 1/17/19 | 0.008 |
| 1/18/19 | 0.007 |
| 1/22/19 | 0.008 |
| 1/23/19 | 0.007 |
| 1/24/19 | 0.007 |
| 1/25/19 | 0.007 |
| 1/28/19 | 0.008 |
| 1/29/19 | 0.008 |
| 1/30/19 | 0.008 |
| 1/31/19 | 0.008 |
| 2/1/19 | 0.007 |
| 2/4/19 | 0.007 |
| 2/5/19 | 0.007 |
| 2/6/19 | 0.007 |
| 2/7/19 | 0.007 |
| 2/8/19 | 0.007 |
| 2/11/19 | 0.007 |
| 2/12/19 | 0.007 |
| 2/13/19 | 0.007 |
| 2/14/19 | 0.007 |
| 2/15/19 | 0.007 |
| 2/19/19 | 0.007 |
| 2/20/19 | 0.007 |
| 2/21/19 | 0.006 |
| 2/22/19 | 0.006 |
| 2/25/19 | 0.006 |
| 2/26/19 | 0.007 |
| 2/27/19 | 0.006 |
| 2/28/19 | 0.006 |
| 3/1/19 | 0.005 |
| 3/4/19 | 0.006 |
| 3/5/19 | 0.006 |
| 3/6/19 | 0.006 |
| 3/7/19 | 0.007 |
| 3/8/19 | 0.007 |
| 3/11/19 | 0.006 |
| 3/12/19 | 0.006 |
| 3/13/19 | 0.006 |
| 3/14/19 | 0.006 |
| 3/15/19 | 0.006 |
| 3/18/19 | 0.006 |
| 3/19/19 | 0.007 |
| 3/20/19 | 0.007 |
| 3/21/19 | 0.007 |
| 3/22/19 | 0.008 |
| 3/25/19 | 0.008 |
| 3/26/19 | 0.008 |
| 3/27/19 | 0.008 |
| 3/28/19 | 0.009 |
| 3/29/19 | 0.008 |
| 4/1/19 | 0.008 |
| 4/2/19 | 0.008 |
| 4/3/19 | 0.008 |
| 4/4/19 | 0.008 |
| 4/5/19 | 0.008 |
| 4/8/19 | 0.008 |
| 4/9/19 | 0.008 |
| 4/10/19 | 0.008 |
| 4/11/19 | 0.008 |
| 4/12/19 | 0.007 |
| 4/15/19 | 0.007 |
| 4/16/19 | 0.007 |
| 4/17/19 | 0.007 |
| 4/18/19 | 0.007 |
| 4/22/19 | 0.007 |
| 4/23/19 | 0.007 |
| 4/24/19 | 0.007 |
| 4/25/19 | 0.007 |
| 4/26/19 | 0.007 |
| 4/29/19 | 0.007 |
| 4/30/19 | 0.007 |
| 5/1/19 | 0.007 |
| 5/2/19 | 0.007 |
| 5/3/19 | 0.007 |
| 5/6/19 | 0.008 |
| 5/7/19 | 0.008 |
| 5/8/19 | 0.008 |
| 5/9/19 | 0.009 |
| 5/10/19 | 0.008 |
| 5/13/19 | 0.008 |
| 5/14/19 | 0.008 |
| 5/15/19 | 0.009 |
| 5/16/19 | 0.009 |
| 5/17/19 | 0.009 |
| 5/20/19 | 0.008 |
| 5/21/19 | 0.008 |
| 5/22/19 | 0.008 |
| 5/23/19 | 0.009 |
| 5/24/19 | 0.009 |
| 5/28/19 | 0.01 |
| 5/29/19 | 0.01 |
| 5/30/19 | 0.011 |
| 5/31/19 | 0.011 |
| 6/3/19 | 0.012 |
| 6/4/19 | 0.011 |
| 6/5/19 | 0.011 |
| 6/6/19 | 0.011 |
| 6/7/19 | 0.011 |
| 6/10/19 | 0.011 |
| 6/11/19 | 0.011 |
| 6/12/19 | 0.011 |
| 6/13/19 | 0.011 |
| 6/14/19 | 0.011 |
| 6/17/19 | 0.011 |
| 6/18/19 | 0.011 |
| 6/19/19 | 0.011 |
| 6/20/19 | 0.011 |
| 6/21/19 | 0.011 |
| 6/24/19 | 0.011 |
| 6/25/19 | 0.012 |
| 6/26/19 | 0.012 |
| 6/27/19 | 0.012 |
| 6/28/19 | 0.012 |
| 7/1/19 | 0.012 |
| 7/2/19 | 0.012 |
| 7/3/19 | 0.012 |
| 7/5/19 | 0.011 |
| 7/8/19 | 0.011 |
| 7/9/19 | 0.011 |
| 7/10/19 | 0.011 |
| 7/11/19 | 0.01 |
| 7/12/19 | 0.01 |
| 7/15/19 | 0.011 |
| 7/16/19 | 0.01 |
| 7/17/19 | 0.011 |
| 7/18/19 | 0.011 |
| 7/19/19 | 0.011 |
| 7/22/19 | 0.011 |
| 7/23/19 | 0.011 |
| 7/24/19 | 0.012 |
| 7/25/19 | 0.011 |
| 7/26/19 | 0.011 |
| 7/29/19 | 0.011 |
| 7/30/19 | 0.011 |
| 7/31/19 | 0.012 |
| 8/1/19 | 0.013 |
| 8/2/19 | 0.013 |
| 8/5/19 | 0.015 |
| 8/6/19 | 0.015 |
| 8/7/19 | 0.015 |
| 8/8/19 | 0.014 |
| 8/9/19 | 0.014 |
| 8/12/19 | 0.015 |
| 8/13/19 | 0.015 |
| 8/14/19 | 0.016 |
| 8/15/19 | 0.016 |
| 8/16/19 | 0.016 |
| 8/19/19 | 0.015 |
| 8/20/19 | 0.016 |
| 8/21/19 | 0.015 |
| 8/22/19 | 0.015 |
| 8/23/19 | 0.016 |
| 8/26/19 | 0.016 |
| 8/27/19 | 0.016 |
| 8/28/19 | 0.017 |
| 8/29/19 | 0.016 |
| 8/30/19 | 0.016 |
| 9/3/19 | 0.016 |
| 9/4/19 | 0.016 |
| 9/5/19 | 0.015 |
| 9/6/19 | 0.016 |
| 9/9/19 | 0.015 |
| 9/10/19 | 0.014 |
| 9/11/19 | 0.013 |
| 9/12/19 | 0.013 |
| 9/13/19 | 0.012 |
| 9/16/19 | 0.013 |
| 9/17/19 | 0.013 |
| 9/18/19 | 0.013 |
| 9/19/19 | 0.013 |
| 9/20/19 | 0.013 |
| 9/23/19 | 0.013 |
| 9/24/19 | 0.014 |
| 9/25/19 | 0.013 |
| 9/26/19 | 0.013 |
| 9/27/19 | 0.013 |
| 9/30/19 | 0.013 |
| 10/1/19 | 0.014 |
| 10/2/19 | 0.015 |
| 10/3/19 | 0.015 |
| 10/4/19 | 0.015 |
| 10/7/19 | 0.014 |
| 10/8/19 | 0.015 |
| 10/9/19 | 0.014 |
| 10/10/19 | 0.014 |
| 10/11/19 | 0.013 |
| 10/14/19 | 0.013 |
| 10/15/19 | 0.013 |
| 10/16/19 | 0.013 |
| 10/17/19 | 0.013 |
| 10/18/19 | 0.013 |
| 10/21/19 | 0.012 |
| 10/22/19 | 0.012 |
| 10/23/19 | 0.012 |
| 10/24/19 | 0.012 |
| 10/25/19 | 0.012 |
| 10/28/19 | 0.012 |
| 10/29/19 | 0.012 |
| 10/30/19 | 0.013 |
| 10/31/19 | 0.013 |
| 11/1/19 | 0.013 |
| 11/4/19 | 0.013 |
| 11/5/19 | 0.012 |
| 11/6/19 | 0.013 |
| 11/7/19 | 0.012 |
| 11/8/19 | 0.012 |
| 11/11/19 | 0.012 |
| 11/12/19 | 0.013 |
| 11/13/19 | 0.013 |
| 11/14/19 | 0.013 |
| 11/15/19 | 0.013 |
| 11/18/19 | 0.013 |
| 11/19/19 | 0.013 |
| 11/20/19 | 0.014 |
| 11/21/19 | 0.014 |
| 11/22/19 | 0.014 |
| 11/25/19 | 0.014 |
| 11/26/19 | 0.014 |
| 11/27/19 | 0.014 |
| 11/29/19 | 0.014 |
| 12/2/19 | 0.013 |
| 12/3/19 | 0.014 |
| 12/4/19 | 0.013 |
| 12/5/19 | 0.013 |
| 12/6/19 | 0.013 |
| 12/9/19 | 0.013 |
| 12/10/19 | 0.013 |
| 12/11/19 | 0.014 |
| 12/12/19 | 0.012 |
| 12/13/19 | 0.013 |
| 12/16/19 | 0.012 |
| 12/17/19 | 0.012 |
| 12/18/19 | 0.012 |
| 12/19/19 | 0.012 |
| 12/20/19 | 0.011 |
| 12/23/19 | 0.012 |
| 12/24/19 | 0.012 |
| 12/26/19 | 0.012 |
| 12/27/19 | 0.012 |
| 12/30/19 | 0.012 |
| 12/31/19 | 0.011 |
| 1/2/20 | 0.012 |
| 1/3/20 | 0.013 |
| 1/6/20 | 0.013 |
| 1/7/20 | 0.013 |
| 1/8/20 | 0.012 |
| 1/9/20 | 0.012 |
| 1/10/20 | 0.012 |
| 1/13/20 | 0.012 |
| 1/14/20 | 0.012 |
| 1/15/20 | 0.012 |
| 1/16/20 | 0.012 |
| 1/17/20 | 0.011 |
| 1/21/20 | 0.012 |
| 1/22/20 | 0.012 |
| 1/23/20 | 0.012 |
| 1/24/20 | 0.012 |
| 1/27/20 | 0.013 |
| 1/28/20 | 0.012 |
| 1/29/20 | 0.013 |
| 1/30/20 | 0.013 |
| 1/31/20 | 0.014 |
| 2/3/20 | 0.013 |
| 2/4/20 | 0.013 |
| 2/5/20 | 0.012 |
| 2/6/20 | 0.012 |
| 2/7/20 | 0.013 |
| 2/10/20 | 0.013 |
| 2/11/20 | 0.013 |
| 2/12/20 | 0.012 |
| 2/13/20 | 0.012 |
| 2/14/20 | 0.012 |
| 2/18/20 | 0.013 |
| 2/19/20 | 0.013 |
| 2/20/20 | 0.013 |
| 2/21/20 | 0.014 |
| 2/24/20 | 0.015 |
| 2/25/20 | 0.016 |
| 2/26/20 | 0.016 |
| 2/27/20 | 0.018 |
| 2/28/20 | 0.021 |
| 3/2/20 | 0.019 |
| 3/3/20 | 0.021 |
| 3/4/20 | 0.019 |
| 3/5/20 | 0.02 |
| 3/6/20 | 0.023 |
| 3/9/20 | 0.026 |
| 3/10/20 | 0.024 |
| 3/11/20 | 0.025 |
| 3/12/20 | 0.028 |
| 3/13/20 | 0.026 |
| 3/16/20 | 0.032 |
| 3/17/20 | 0.025 |
| 3/18/20 | 0.025 |
| 3/19/20 | 0.028 |
| 3/20/20 | 0.033 |
| 3/23/20 | 0.037 |
| 3/24/20 | 0.032 |
| 3/25/20 | 0.03 |
| 3/26/20 | 0.028 |
| 3/27/20 | 0.029 |
| 3/30/20 | 0.028 |
| 3/31/20 | 0.029 |
| 4/1/20 | 0.032 |
| 4/2/20 | 0.031 |
| 4/3/20 | 0.032 |
| 4/6/20 | 0.029 |
| 4/7/20 | 0.029 |
| 4/8/20 | 0.027 |
| 4/9/20 | 0.026 |
| 4/13/20 | 0.026 |
| 4/14/20 | 0.025 |
| 4/15/20 | 0.028 |
| 4/16/20 | 0.028 |
| 4/17/20 | 0.027 |
| 4/20/20 | 0.028 |
| 4/21/20 | 0.029 |
| 4/22/20 | 0.028 |
| 4/23/20 | 0.028 |
| 4/24/20 | 0.028 |
| 4/27/20 | 0.027 |
| 4/28/20 | 0.028 |
| 4/29/20 | 0.028 |
| 4/30/20 | 0.029 |
| 5/1/20 | 0.03 |
| 5/4/20 | 0.029 |
| 5/5/20 | 0.029 |
| 5/6/20 | 0.03 |
| 5/7/20 | 0.03 |
| 5/8/20 | 0.029 |
| 5/11/20 | 0.029 |
| 5/12/20 | 0.029 |
| 5/13/20 | 0.03 |
| 5/14/20 | 0.03 |
| 5/15/20 | 0.031 |
| 5/18/20 | 0.028 |
| 5/19/20 | 0.029 |
| 5/20/20 | 0.029 |
| 5/21/20 | 0.029 |
| 5/22/20 | 0.029 |
| 5/26/20 | 0.029 |
| 5/27/20 | 0.028 |
| 5/28/20 | 0.027 |
| 5/29/20 | 0.027 |
| 6/1/20 | 0.027 |
| 6/2/20 | 0.027 |
| 6/3/20 | 0.025 |
| 6/4/20 | 0.025 |
| 6/5/20 | 0.024 |
| 6/8/20 | 0.024 |
| 6/9/20 | 0.025 |
| 6/10/20 | 0.026 |
| 6/11/20 | 0.028 |
| 6/12/20 | 0.028 |
| 6/15/20 | 0.027 |
| 6/16/20 | 0.027 |
| 6/17/20 | 0.027 |
| 6/18/20 | 0.027 |
| 6/19/20 | 0.029 |
| 6/22/20 | 0.028 |
| 6/23/20 | 0.028 |
| 6/24/20 | 0.029 |
| 6/25/20 | 0.03 |
| 6/26/20 | 0.03 |
| 6/29/20 | 0.03 |
| 6/30/20 | 0.029 |
| 7/1/20 | 0.028 |
| 7/2/20 | 0.028 |
| 7/6/20 | 0.029 |
| 7/7/20 | 0.029 |
| 7/8/20 | 0.029 |
| 7/9/20 | 0.029 |
| 7/10/20 | 0.029 |
| 7/13/20 | 0.029 |
| 7/14/20 | 0.028 |
| 7/15/20 | 0.028 |
| 7/16/20 | 0.028 |
| 7/17/20 | 0.027 |
| 7/20/20 | 0.028 |
| 7/21/20 | 0.028 |
| 7/22/20 | 0.027 |
| 7/23/20 | 0.028 |
| 7/24/20 | 0.028 |
| 7/27/20 | 0.028 |
| 7/28/20 | 0.028 |
| 7/29/20 | 0.028 |
| 7/30/20 | 0.028 |
| 7/31/20 | 0.028 |
| 8/3/20 | 0.028 |
| 8/4/20 | 0.028 |
| 8/5/20 | 0.028 |
| 8/6/20 | 0.028 |
| 8/7/20 | 0.027 |
| 8/10/20 | 0.027 |
| 8/11/20 | 0.028 |
| 8/12/20 | 0.026 |
| 8/13/20 | 0.026 |
| 8/14/20 | 0.027 |
| 8/17/20 | 0.027 |
| 8/18/20 | 0.028 |
| 8/19/20 | 0.027 |
| 8/20/20 | 0.028 |
| 8/21/20 | 0.028 |
| 8/24/20 | 0.028 |
| 8/25/20 | 0.028 |
| 8/26/20 | 0.028 |
| 8/27/20 | 0.028 |
| 8/28/20 | 0.027 |
| 8/31/20 | 0.028 |
| 9/1/20 | 0.028 |
| 9/2/20 | 0.027 |
| 9/3/20 | 0.028 |
| 9/4/20 | 0.027 |
| 9/8/20 | 0.028 |
| 9/9/20 | 0.027 |
| 9/10/20 | 0.028 |
| 9/11/20 | 0.028 |
| 9/14/20 | 0.028 |
| 9/15/20 | 0.028 |
| 9/16/20 | 0.027 |
| 9/17/20 | 0.028 |
| 9/18/20 | 0.028 |
| 9/21/20 | 0.029 |
| 9/22/20 | 0.028 |
| 9/23/20 | 0.029 |
| 9/24/20 | 0.029 |
| 9/25/20 | 0.028 |
| 9/28/20 | 0.028 |
| 9/29/20 | 0.028 |
| 9/30/20 | 0.028 |
| 10/1/20 | 0.029 |
| 10/2/20 | 0.028 |
| 10/5/20 | 0.027 |
| 10/6/20 | 0.027 |
| 10/7/20 | 0.026 |
| 10/8/20 | 0.026 |
| 10/9/20 | 0.026 |
| 10/12/20 | 0.026 |
| 10/13/20 | 0.026 |
| 10/14/20 | 0.027 |
| 10/15/20 | 0.026 |
| 10/16/20 | 0.026 |
| 10/19/20 | 0.026 |
| 10/20/20 | 0.026 |
| 10/21/20 | 0.025 |
| 10/22/20 | 0.025 |
| 10/23/20 | 0.025 |
| 10/26/20 | 0.025 |
| 10/27/20 | 0.025 |
| 10/28/20 | 0.026 |
| 10/29/20 | 0.026 |
| 10/30/20 | 0.026 |
| 11/2/20 | 0.025 |
| 11/3/20 | 0.024 |
| 11/4/20 | 0.026 |
| 11/5/20 | 0.026 |
| 11/6/20 | 0.025 |
| 11/9/20 | 0.024 |
| 11/10/20 | 0.023 |
| 11/11/20 | 0.023 |
| 11/12/20 | 0.024 |
| 11/13/20 | 0.024 |
| 11/16/20 | 0.023 |
| 11/17/20 | 0.024 |
| 11/18/20 | 0.025 |
| 11/19/20 | 0.026 |
| 11/20/20 | 0.026 |
| 11/23/20 | 0.026 |
| 11/24/20 | 0.025 |
| 11/25/20 | 0.025 |
| 11/27/20 | 0.026 |
| 11/30/20 | 0.026 |
| 12/1/20 | 0.025 |
| 12/2/20 | 0.025 |
| 12/3/20 | 0.025 |
| 12/4/20 | 0.025 |
| 12/7/20 | 0.025 |
| 12/8/20 | 0.025 |
| 12/9/20 | 0.025 |
| 12/10/20 | 0.026 |
| 12/11/20 | 0.026 |
| 12/14/20 | 0.026 |
| 12/15/20 | 0.025 |
| 12/16/20 | 0.026 |
| 12/17/20 | 0.025 |
| 12/18/20 | 0.025 |
| 12/21/20 | 0.026 |
| 12/22/20 | 0.026 |
| 12/23/20 | 0.026 |
| 12/24/20 | 0.026 |
| 12/28/20 | 0.026 |
| 12/29/20 | 0.026 |
| 12/30/20 | 0.025 |
| 12/31/20 | 0.025 |
| 1/4/21 | 0.024 |
| 1/5/21 | 0.024 |
| 1/6/21 | 0.022 |
| 1/7/21 | 0.022 |
| 1/8/21 | 0.022 |
| 1/11/21 | 0.022 |
| 1/12/21 | 0.022 |
| 1/13/21 | 0.022 |
| 1/14/21 | 0.021 |
| 1/15/21 | 0.022 |
| 1/19/21 | 0.022 |
| 1/20/21 | 0.022 |
| 1/21/21 | 0.022 |
| 1/22/21 | 0.022 |
| 1/25/21 | 0.022 |
| 1/26/21 | 0.022 |
| 1/27/21 | 0.023 |
| 1/28/21 | 0.022 |
| 1/29/21 | 0.022 |
| 2/1/21 | 0.022 |
| 2/2/21 | 0.021 |
| 2/3/21 | 0.021 |
| 2/4/21 | 0.021 |
| 2/5/21 | 0.02 |
| 2/8/21 | 0.021 |
| 2/9/21 | 0.021 |
| 2/10/21 | 0.021 |
| 2/11/21 | 0.021 |
| 2/12/21 | 0.021 |
| 2/16/21 | 0.02 |
| 2/17/21 | 0.02 |
| 2/18/21 | 0.02 |
| 2/19/21 | 0.02 |
| 2/22/21 | 0.021 |
| 2/23/21 | 0.02 |
| 2/24/21 | 0.021 |
| 2/25/21 | 0.019 |
| 2/26/21 | 0.021 |
| 3/1/21 | 0.02 |
| 3/2/21 | 0.021 |
| 3/3/21 | 0.021 |
| 3/4/21 | 0.02 |
| 3/5/21 | 0.019 |
| 3/8/21 | 0.018 |
| 3/9/21 | 0.018 |
| 3/10/21 | 0.018 |
| 3/11/21 | 0.018 |
| 3/12/21 | 0.017 |
| 3/15/21 | 0.016 |
| 3/16/21 | 0.016 |
| 3/17/21 | 0.017 |
| 3/18/21 | 0.016 |
| 3/19/21 | 0.016 |
| 3/22/21 | 0.016 |
| 3/23/21 | 0.016 |
| 3/24/21 | 0.016 |
| 3/25/21 | 0.016 |
| 3/26/21 | 0.016 |
| 3/29/21 | 0.015 |
| 3/30/21 | 0.015 |
| 3/31/21 | 0.015 |
| 4/1/21 | 0.015 |
| 4/5/21 | 0.014 |
| 4/6/21 | 0.015 |
| 4/7/21 | 0.015 |
| 4/8/21 | 0.015 |
| 4/9/21 | 0.015 |
| 4/12/21 | 0.015 |
| 4/13/21 | 0.015 |
| 4/14/21 | 0.015 |
| 4/15/21 | 0.015 |
| 4/16/21 | 0.015 |
| 4/19/21 | 0.015 |
| 4/20/21 | 0.014 |
| 4/21/21 | 0.015 |
| 4/22/21 | 0.015 |
| 4/23/21 | 0.015 |
| 4/26/21 | 0.015 |
| 4/27/21 | 0.015 |
| 4/28/21 | 0.015 |
| 4/29/21 | 0.014 |
| 4/30/21 | 0.014 |
| 5/3/21 | 0.015 |
| 5/4/21 | 0.015 |
| 5/5/21 | 0.016 |
| 5/6/21 | 0.015 |
| 5/7/21 | 0.015 |
| 5/10/21 | 0.015 |
| 5/11/21 | 0.015 |
| 5/12/21 | 0.015 |
| 5/13/21 | 0.015 |
| 5/14/21 | 0.015 |
| 5/17/21 | 0.015 |
| 5/18/21 | 0.015 |
| 5/19/21 | 0.015 |
| 5/20/21 | 0.015 |
| 5/21/21 | 0.015 |
| 5/24/21 | 0.015 |
| 5/25/21 | 0.016 |
| 5/26/21 | 0.016 |
| 5/27/21 | 0.016 |
| 5/28/21 | 0.016 |
| 6/1/21 | 0.016 |
| 6/2/21 | 0.016 |
| 6/3/21 | 0.015 |
| 6/4/21 | 0.016 |
| 6/7/21 | 0.016 |
| 6/8/21 | 0.016 |
| 6/9/21 | 0.016 |
| 6/10/21 | 0.017 |
| 6/11/21 | 0.016 |
| 6/14/21 | 0.016 |
| 6/15/21 | 0.016 |
| 6/16/21 | 0.016 |
| 6/17/21 | 0.016 |
| 6/18/21 | 0.018 |
| 6/21/21 | 0.017 |
| 6/22/21 | 0.017 |
| 6/23/21 | 0.017 |
| 6/24/21 | 0.018 |
| 6/25/21 | 0.017 |
| 6/28/21 | 0.017 |
| 6/29/21 | 0.018 |
| 6/30/21 | 0.018 |
| 7/1/21 | 0.017 |
| 7/2/21 | 0.018 |
| 7/6/21 | 0.018 |
| 7/7/21 | 0.019 |
| 7/8/21 | 0.019 |
| 7/9/21 | 0.018 |
| 7/12/21 | 0.018 |
| 7/13/21 | 0.018 |
| 7/14/21 | 0.018 |
| 7/15/21 | 0.018 |
| 7/16/21 | 0.018 |
| 7/19/21 | 0.02 |
| 7/20/21 | 0.019 |
| 7/21/21 | 0.019 |
| 7/22/21 | 0.019 |
| 7/23/21 | 0.018 |
| 7/26/21 | 0.019 |
| 7/27/21 | 0.018 |
| 7/28/21 | 0.018 |
| 7/29/21 | 0.018 |
| 7/30/21 | 0.019 |
| 8/2/21 | 0.019 |
| 8/3/21 | 0.019 |
| 8/4/21 | 0.019 |
| 8/5/21 | 0.018 |
| 8/6/21 | 0.018 |
| 8/9/21 | 0.017 |
| 8/10/21 | 0.017 |
| 8/11/21 | 0.017 |
| 8/12/21 | 0.017 |
| 8/13/21 | 0.017 |
| 8/16/21 | 0.017 |
| 8/17/21 | 0.017 |
| 8/18/21 | 0.018 |
| 8/19/21 | 0.018 |
| 8/20/21 | 0.017 |
| 8/23/21 | 0.018 |
| 8/24/21 | 0.017 |
| 8/25/21 | 0.017 |
| 8/26/21 | 0.017 |
| 8/27/21 | 0.017 |
| 8/30/21 | 0.018 |
| 8/31/21 | 0.017 |
| 9/1/21 | 0.017 |
| 9/2/21 | 0.017 |
| 9/3/21 | 0.016 |
| 9/7/21 | 0.016 |
| 9/8/21 | 0.016 |
| 9/9/21 | 0.017 |
| 9/10/21 | 0.017 |
| 9/13/21 | 0.017 |
| 9/14/21 | 0.018 |
| 9/15/21 | 0.018 |
| 9/16/21 | 0.017 |
| 9/17/21 | 0.018 |
| 9/20/21 | 0.018 |
| 9/21/21 | 0.018 |
| 9/22/21 | 0.018 |
| 9/23/21 | 0.018 |
| 9/24/21 | 0.017 |
| 9/27/21 | 0.017 |
| 9/28/21 | 0.017 |
| 9/29/21 | 0.016 |
| 9/30/21 | 0.017 |
| 10/1/21 | 0.018 |
| 10/4/21 | 0.017 |
| 10/5/21 | 0.016 |
| 10/6/21 | 0.016 |
| 10/7/21 | 0.016 |
| 10/8/21 | 0.016 |
| 10/11/21 | 0.016 |
| 10/12/21 | 0.016 |
| 10/13/21 | 0.016 |
| 10/14/21 | 0.016 |
| 10/15/21 | 0.016 |
| 10/18/21 | 0.016 |
| 10/19/21 | 0.015 |
| 10/20/21 | 0.014 |
| 10/21/21 | 0.014 |
| 10/22/21 | 0.014 |
| 10/25/21 | 0.014 |
| 10/26/21 | 0.014 |
| 10/27/21 | 0.015 |
| 10/28/21 | 0.015 |
| 10/29/21 | 0.015 |
| 11/1/21 | 0.015 |
| 11/2/21 | 0.015 |
| 11/3/21 | 0.015 |
| 11/4/21 | 0.016 |
| 11/5/21 | 0.016 |
| 11/8/21 | 0.016 |
| 11/9/21 | 0.016 |
| 11/10/21 | 0.015 |
| 11/12/21 | 0.015 |
| 11/15/21 | 0.015 |
| 11/16/21 | 0.015 |
| 11/17/21 | 0.015 |
| 11/18/21 | 0.015 |
| 11/19/21 | 0.015 |
| 11/22/21 | 0.015 |
| 11/23/21 | 0.014 |
| 11/24/21 | 0.014 |
| 11/26/21 | 0.016 |
| 11/29/21 | 0.016 |
| 11/30/21 | 0.018 |
| 12/1/21 | 0.017 |
| 12/2/21 | 0.017 |
| 12/3/21 | 0.017 |
| 12/6/21 | 0.016 |
| 12/7/21 | 0.015 |
| 12/8/21 | 0.015 |
| 12/9/21 | 0.016 |
| 12/10/21 | 0.015 |
| 12/13/21 | 0.016 |
| 12/14/21 | 0.016 |
| 12/15/21 | 0.015 |
| 12/16/21 | 0.015 |
| 12/17/21 | 0.016 |
| 12/20/21 | 0.016 |
| 12/21/21 | 0.015 |
| 12/22/21 | 0.015 |
| 12/23/21 | 0.015 |
| 12/27/21 | 0.015 |
| 12/28/21 | 0.014 |
| 12/29/21 | 0.014 |
| 12/30/21 | 0.014 |
| 12/31/21 | 0.014 |
| 1/3/22 | 0.013 |
| 1/4/22 | 0.013 |
| 1/5/22 | 0.012 |
| 1/6/22 | 0.012 |
| 1/7/22 | 0.012 |
| 1/10/22 | 0.012 |
| 1/11/22 | 0.012 |
| 1/12/22 | 0.013 |
| 1/13/22 | 0.013 |
| 1/14/22 | 0.012 |
| 1/18/22 | 0.012 |
| 1/19/22 | 0.012 |
| 1/20/22 | 0.012 |
| 1/21/22 | 0.013 |
| 1/24/22 | 0.013 |
| 1/25/22 | 0.013 |
| 1/26/22 | 0.013 |
| 1/27/22 | 0.013 |
| 1/28/22 | 0.013 |
| 1/31/22 | 0.012 |
| 2/1/22 | 0.012 |
| 2/2/22 | 0.012 |
| 2/3/22 | 0.012 |
| 2/4/22 | 0.011 |
| 2/7/22 | 0.011 |
| 2/8/22 | 0.011 |
| 2/9/22 | 0.011 |
| 2/10/22 | 0.011 |
| 2/11/22 | 0.012 |
| 2/14/22 | 0.012 |
| 2/15/22 | 0.011 |
| 2/16/22 | 0.011 |
| 2/17/22 | 0.012 |
| 2/18/22 | 0.012 |
| 2/22/22 | 0.012 |
| 2/23/22 | 0.012 |
| 2/24/22 | 0.012 |
| 2/25/22 | 0.011 |
| 2/28/22 | 0.013 |
| 3/1/22 | 0.014 |
| 3/2/22 | 0.012 |
| 3/3/22 | 0.012 |
| 3/4/22 | 0.012 |
| 3/7/22 | 0.012 |
| 3/8/22 | 0.011 |
| 3/9/22 | 0.011 |
| 3/10/22 | 0.01 |
| 3/11/22 | 0.01 |
| 3/14/22 | 0.008 |
| 3/15/22 | 0.008 |
| 3/16/22 | 0.008 |
| 3/17/22 | 0.008 |
| 3/18/22 | 0.008 |
| 3/21/22 | 0.006 |
| 3/22/22 | 0.006 |
| 3/23/22 | 0.006 |
| 3/24/22 | 0.006 |
| 3/25/22 | 0.004 |
| 3/28/22 | 0.004 |
| 3/29/22 | 0.004 |
| 3/30/22 | 0.005 |
| 3/31/22 | 0.005 |
| 4/1/22 | 0.004 |
| 4/4/22 | 0.004 |
| 4/5/22 | 0.002 |
| 4/6/22 | 0.001 |
| 4/7/22 | 0.001 |
| 4/8/22 | 0 |
| 4/11/22 | 0 |
| 4/12/22 | 0 |
| 4/13/22 | 0 |
| 4/14/22 | -0.001 |
| 4/18/22 | -0.001 |
| 4/19/22 | -0.002 |
| 4/20/22 | -0.001 |
| 4/21/22 | -0.001 |
| 4/22/22 | -0.001 |
| 4/25/22 | 0 |
| 4/26/22 | 0.001 |
| 4/27/22 | 0.001 |
| 4/28/22 | 0 |
| 4/29/22 | 0 |
| 5/2/22 | 0 |
| 5/3/22 | 0 |
| 5/4/22 | 0 |
| 5/5/22 | -0.001 |
| 5/6/22 | -0.002 |
| 5/9/22 | -0.001 |
| 5/10/22 | 0 |
| 5/11/22 | 0 |
| 5/12/22 | 0.001 |
| 5/13/22 | 0 |
| 5/16/22 | 0.001 |
| 5/17/22 | -0.001 |
| 5/18/22 | 0.001 |
| 5/19/22 | 0.001 |
| 5/20/22 | 0.002 |
| 5/23/22 | 0.001 |
| 5/24/22 | 0.001 |
| 5/25/22 | 0.001 |
| 5/26/22 | 0.001 |
| 5/27/22 | 0.001 |
| 5/31/22 | 0 |
| 6/1/22 | -0.001 |
| 6/2/22 | -0.001 |
| 6/3/22 | -0.001 |
| 6/6/22 | -0.002 |
| 6/7/22 | -0.001 |
| 6/8/22 | -0.001 |
| 6/9/22 | -0.001 |
| 6/10/22 | -0.002 |
| 6/13/22 | -0.003 |
| 6/14/22 | -0.003 |
| 6/15/22 | -0.001 |
| 6/16/22 | 0 |
| 6/17/22 | 0 |
| 6/21/22 | -0.001 |
| 6/22/22 | 0 |
| 6/23/22 | 0 |
| 6/24/22 | -0.001 |
| 6/27/22 | -0.002 |
| 6/28/22 | -0.002 |
| 6/29/22 | -0.001 |
| 6/30/22 | 0 |
| 7/1/22 | 0 |
| 7/5/22 | 0.002 |
| 7/6/22 | 0.001 |
| 7/7/22 | 0 |
| 7/8/22 | -0.001 |
| 7/11/22 | 0 |
| 7/12/22 | 0 |
| 7/13/22 | 0.001 |
| 7/14/22 | 0.001 |
| 7/15/22 | 0.001 |
| 7/18/22 | 0.001 |
| 7/19/22 | 0 |
| 7/20/22 | 0 |
| 7/21/22 | 0.002 |
| 7/22/22 | 0.003 |
| 7/25/22 | 0.002 |
| 7/26/22 | 0.002 |
| 7/27/22 | 0.002 |
| 7/28/22 | 0.002 |
| 7/29/22 | 0.002 |
| 8/1/22 | 0.002 |
| 8/2/22 | 0.001 |
| 8/3/22 | 0.001 |
| 8/4/22 | 0.002 |
| 8/5/22 | 0 |
| 8/8/22 | 0.001 |
| 8/9/22 | 0 |
| 8/10/22 | 0 |
| 8/11/22 | -0.001 |
| 8/12/22 | -0.001 |
| 8/15/22 | -0.001 |
| 8/16/22 | -0.001 |
| 8/17/22 | -0.002 |
| 8/18/22 | -0.001 |
| 8/19/22 | -0.002 |
| 8/22/22 | -0.003 |
| 8/23/22 | -0.003 |
| 8/24/22 | -0.003 |
| 8/25/22 | -0.003 |
| 8/26/22 | -0.002 |
| 8/29/22 | -0.003 |
| 8/30/22 | -0.003 |
| 8/31/22 | -0.003 |
| 9/1/22 | -0.004 |
| 9/2/22 | -0.003 |
| 9/6/22 | -0.005 |
| 9/7/22 | -0.005 |
| 9/8/22 | -0.005 |
| 9/9/22 | -0.006 |
| 9/12/22 | -0.006 |
| 9/13/22 | -0.006 |
| 9/14/22 | -0.006 |
| 9/15/22 | -0.006 |
| 9/16/22 | -0.006 |
| 9/19/22 | -0.007 |
| 9/20/22 | -0.007 |
| 9/21/22 | -0.006 |
| 9/22/22 | -0.008 |
| 9/23/22 | -0.007 |
| 9/26/22 | -0.009 |
| 9/27/22 | -0.009 |
| 9/28/22 | -0.007 |
| 9/29/22 | -0.006 |
| 9/30/22 | -0.006 |
| 10/3/22 | -0.006 |
| 10/4/22 | -0.006 |
| 10/5/22 | -0.007 |
| 10/6/22 | -0.006 |
| 10/7/22 | -0.006 |
| 10/10/22 | -0.006 |
| 10/11/22 | -0.007 |
| 10/12/22 | -0.005 |
| 10/13/22 | -0.007 |
| 10/14/22 | -0.007 |
| 10/17/22 | -0.007 |
| 10/18/22 | -0.008 |
| 10/19/22 | -0.009 |
| 10/20/22 | -0.009 |
| 10/21/22 | -0.009 |
| 10/24/22 | -0.01 |
| 10/25/22 | -0.009 |
| 10/26/22 | -0.008 |
| 10/27/22 | -0.008 |
| 10/28/22 | -0.009 |
| 10/31/22 | -0.01 |
| 11/1/22 | -0.01 |
| 11/2/22 | -0.01 |
| 11/3/22 | -0.01 |
| 11/4/22 | -0.011 |
| 11/7/22 | -0.011 |
| 11/8/22 | -0.01 |
| 11/9/22 | -0.01 |
| 11/10/22 | -0.008 |
| 11/14/22 | -0.008 |
| 11/15/22 | -0.007 |
| 11/16/22 | -0.006 |
| 11/17/22 | -0.007 |
| 11/18/22 | -0.008 |
| 11/21/22 | -0.008 |
| 11/22/22 | -0.008 |
| 11/23/22 | -0.007 |
| 11/25/22 | -0.007 |
| 11/28/22 | -0.007 |
| 11/29/22 | -0.007 |
| 11/30/22 | -0.007 |
| 12/1/22 | -0.006 |
| 12/2/22 | -0.005 |
| 12/5/22 | -0.006 |
| 12/6/22 | -0.005 |
| 12/7/22 | -0.004 |
| 12/8/22 | -0.005 |
| 12/9/22 | -0.006 |
| 12/12/22 | -0.007 |
| 12/13/22 | -0.006 |
| 12/14/22 | -0.006 |
| 12/15/22 | -0.005 |
| 12/16/22 | -0.005 |
| 12/19/22 | -0.006 |
| 12/20/22 | -0.007 |
| 12/21/22 | -0.007 |
| 12/22/22 | -0.007 |
| 12/23/22 | -0.008 |
| 12/27/22 | -0.009 |
| 12/28/22 | -0.009 |
| 12/29/22 | -0.009 |
| 12/30/22 | -0.009 |
| 1/3/23 | -0.008 |
| 1/4/23 | -0.008 |
| 1/5/23 | -0.007 |
| 1/6/23 | -0.006 |
| 1/9/23 | -0.006 |
| 1/10/23 | -0.007 |
| 1/11/23 | -0.006 |
| 1/12/23 | -0.005 |
| 1/13/23 | -0.006 |
| 1/17/23 | -0.006 |
| 1/18/23 | -0.004 |
| 1/19/23 | -0.004 |
| 1/20/23 | -0.005 |
| 1/23/23 | -0.005 |
| 1/24/23 | -0.005 |
| 1/25/23 | -0.004 |
| 1/26/23 | -0.005 |
| 1/27/23 | -0.005 |
| 1/30/23 | -0.005 |
| 1/31/23 | -0.005 |
| 2/1/23 | -0.004 |
| 2/2/23 | -0.004 |
| 2/3/23 | -0.004 |
| 2/6/23 | -0.006 |
| 2/7/23 | -0.006 |
| 2/8/23 | -0.005 |
| 2/9/23 | -0.005 |
| 2/10/23 | -0.006 |
| 2/13/23 | -0.006 |
| 2/14/23 | -0.007 |
| 2/15/23 | -0.007 |
| 2/16/23 | -0.007 |
| 2/17/23 | -0.007 |
| 2/21/23 | -0.008 |
| 2/22/23 | -0.008 |
| 2/23/23 | -0.007 |
| 2/24/23 | -0.008 |
| 2/27/23 | -0.007 |
| 2/28/23 | -0.007 |
| 3/1/23 | -0.007 |
| 3/2/23 | -0.008 |
| 3/3/23 | -0.008 |
| 3/6/23 | -0.008 |
| 3/7/23 | -0.007 |
| 3/8/23 | -0.008 |
| 3/9/23 | -0.007 |
| 3/10/23 | -0.004 |
| 3/13/23 | -0.003 |
| 3/14/23 | -0.004 |
| 3/15/23 | -0.003 |
| 3/16/23 | -0.004 |
| 3/17/23 | -0.002 |
| 3/20/23 | -0.003 |
| 3/21/23 | -0.004 |
| 3/22/23 | -0.002 |
| 3/23/23 | -0.001 |
| 3/24/23 | -0.002 |
| 3/27/23 | -0.003 |
| 3/28/23 | -0.003 |
| 3/29/23 | -0.004 |
| 3/30/23 | -0.004 |
| 3/31/23 | -0.003 |
| 4/3/23 | -0.003 |
| 4/4/23 | -0.002 |
| 4/5/23 | -0.002 |
| 4/6/23 | -0.003 |
| 4/10/23 | -0.004 |
| 4/11/23 | -0.004 |
| 4/12/23 | -0.004 |
| 4/13/23 | -0.004 |
| 4/14/23 | -0.004 |
| 4/17/23 | -0.005 |
| 4/18/23 | -0.005 |
| 4/19/23 | -0.006 |
| 4/20/23 | -0.005 |
| 4/21/23 | -0.005 |
| 4/24/23 | -0.005 |
| 4/25/23 | -0.004 |
| 4/26/23 | -0.003 |
| 4/27/23 | -0.005 |
| 4/28/23 | -0.004 |
| 5/1/23 | -0.005 |
| 5/2/23 | -0.003 |
| 5/3/23 | -0.003 |
| 5/4/23 | -0.003 |
| 5/5/23 | -0.004 |
| 5/8/23 | -0.004 |
| 5/9/23 | -0.004 |
| 5/10/23 | -0.004 |
| 5/11/23 | -0.003 |
| 5/12/23 | -0.004 |
| 5/15/23 | -0.004 |
| 5/16/23 | -0.003 |
| 5/17/23 | -0.003 |
| 5/18/23 | -0.004 |
| 5/19/23 | -0.005 |
| 5/22/23 | -0.005 |
| 5/23/23 | -0.004 |
| 5/24/23 | -0.005 |
| 5/25/23 | -0.005 |
| 5/26/23 | -0.005 |
| 5/30/23 | -0.003 |
| 5/31/23 | -0.003 |
| 6/1/23 | -0.003 |
| 6/2/23 | -0.004 |
| 6/5/23 | -0.004 |
| 6/6/23 | -0.004 |
| 6/7/23 | -0.005 |
| 6/8/23 | -0.005 |
| 6/9/23 | -0.005 |
| 6/12/23 | -0.005 |
| 6/13/23 | -0.006 |
| 6/14/23 | -0.006 |
| 6/15/23 | -0.005 |
| 6/16/23 | -0.005 |
| 6/20/23 | -0.005 |
| 6/21/23 | -0.005 |
| 6/22/23 | -0.005 |
| 6/23/23 | -0.004 |
| 6/26/23 | -0.005 |
| 6/27/23 | -0.005 |
| 6/28/23 | -0.004 |
| 6/29/23 | -0.005 |
| 6/30/23 | -0.005 |
| 7/3/23 | -0.006 |
| 7/5/23 | -0.007 |
| 7/6/23 | -0.008 |
| 7/7/23 | -0.008 |
| 7/10/23 | -0.007 |
| 7/11/23 | -0.007 |
| 7/12/23 | -0.006 |
| 7/13/23 | -0.006 |
| 7/14/23 | -0.006 |
| 7/17/23 | -0.006 |
| 7/18/23 | -0.005 |
| 7/19/23 | -0.005 |
| 7/20/23 | -0.007 |
| 7/21/23 | -0.007 |
| 7/24/23 | -0.007 |
| 7/25/23 | -0.008 |
| 7/26/23 | -0.007 |
| 7/27/23 | -0.008 |
| 7/28/23 | -0.008 |
| 7/31/23 | -0.008 |
| 8/1/23 | -0.008 |
| 8/2/23 | -0.008 |
| 8/3/23 | -0.009 |
| 8/4/23 | -0.007 |
| 8/7/23 | -0.007 |
| 8/8/23 | -0.007 |
| 8/9/23 | -0.006 |
| 8/10/23 | -0.007 |
| 8/11/23 | -0.008 |
| 8/14/23 | -0.008 |
| 8/15/23 | -0.008 |
| 8/16/23 | -0.009 |
| 8/17/23 | -0.009 |
| 8/18/23 | -0.008 |
| 8/21/23 | -0.009 |
| 8/22/23 | -0.009 |
| 8/23/23 | -0.008 |
| 8/24/23 | -0.008 |
| 8/25/23 | -0.008 |
| 8/28/23 | -0.008 |
| 8/29/23 | -0.007 |
| 8/30/23 | -0.007 |
| 8/31/23 | -0.006 |
| 9/1/23 | -0.007 |
| 9/5/23 | -0.007 |
| 9/6/23 | -0.008 |
| 9/7/23 | -0.008 |
| 9/8/23 | -0.008 |
| 9/11/23 | -0.008 |
| 9/12/23 | -0.008 |
| 9/13/23 | -0.008 |
| 9/14/23 | -0.009 |
| 9/15/23 | -0.01 |
| 9/18/23 | -0.01 |
| 9/19/23 | -0.01 |
| 9/20/23 | -0.01 |
| 9/21/23 | -0.011 |
| 9/22/23 | -0.01 |
| 9/25/23 | -0.011 |
| 9/26/23 | -0.01 |
| 9/27/23 | -0.01 |
| 9/28/23 | -0.009 |
| 9/29/23 | -0.009 |
| 10/2/23 | -0.008 |
| 10/3/23 | -0.01 |
| 10/4/23 | -0.009 |
| 10/5/23 | -0.009 |
| 10/6/23 | -0.01 |
| 10/10/23 | -0.01 |
| 10/11/23 | -0.01 |
| 10/12/23 | -0.01 |
| 10/13/23 | -0.01 |
| 10/16/23 | -0.011 |
| 10/17/23 | -0.012 |
| 10/18/23 | -0.013 |
| 10/19/23 | -0.013 |
| 10/20/23 | -0.012 |
| 10/23/23 | -0.011 |
| 10/24/23 | -0.012 |
| 10/25/23 | -0.013 |
| 10/26/23 | -0.013 |
| 10/27/23 | -0.012 |
| 10/30/23 | -0.012 |
| 10/31/23 | -0.013 |
| 11/1/23 | -0.012 |
| 11/2/23 | -0.011 |
| 11/3/23 | -0.011 |
| 11/6/23 | -0.012 |
| 11/7/23 | -0.01 |
| 11/8/23 | -0.009 |
| 11/9/23 | -0.01 |
| 11/10/23 | -0.01 |
| 11/13/23 | -0.01 |
| 11/14/23 | -0.009 |
| 11/15/23 | -0.01 |
| 11/16/23 | -0.009 |
| 11/17/23 | -0.009 |
| 11/20/23 | -0.009 |
| 11/21/23 | -0.009 |
| 11/22/23 | -0.009 |
| 11/24/23 | -0.01 |
| 11/27/23 | -0.009 |
| 11/28/23 | -0.008 |
| 11/29/23 | -0.007 |
| 11/30/23 | -0.009 |
| 12/1/23 | -0.008 |
| 12/4/23 | -0.008 |
| 12/5/23 | -0.007 |
| 12/6/23 | -0.007 |
| 12/7/23 | -0.007 |
| 12/8/23 | -0.008 |
| 12/11/23 | -0.008 |
| 12/12/23 | -0.007 |
| 12/13/23 | -0.007 |
| 12/14/23 | -0.005 |
| 12/15/23 | -0.005 |
| 12/18/23 | -0.005 |
| 12/19/23 | -0.005 |
| 12/20/23 | -0.004 |
| 12/21/23 | -0.004 |
| 12/22/23 | -0.004 |
| 12/26/23 | -0.004 |
| 12/27/23 | -0.003 |
| 12/28/23 | -0.004 |
| 12/29/23 | -0.004 |
| 1/2/24 | -0.005 |
| 1/3/24 | -0.005 |
| 1/4/24 | -0.006 |
| 1/5/24 | -0.007 |
| 1/8/24 | -0.006 |
| 1/9/24 | -0.006 |
| 1/10/24 | -0.006 |
| 1/11/24 | -0.005 |
| 1/12/24 | -0.005 |
| 1/16/24 | -0.006 |
| 1/17/24 | -0.005 |
| 1/18/24 | -0.005 |
| 1/19/24 | -0.006 |
| 1/22/24 | -0.005 |
| 1/23/24 | -0.005 |
| 1/24/24 | -0.005 |
| 1/25/24 | -0.005 |
| 1/26/24 | -0.006 |
| 1/29/24 | -0.005 |
| 1/30/24 | -0.005 |
| 1/31/24 | -0.004 |